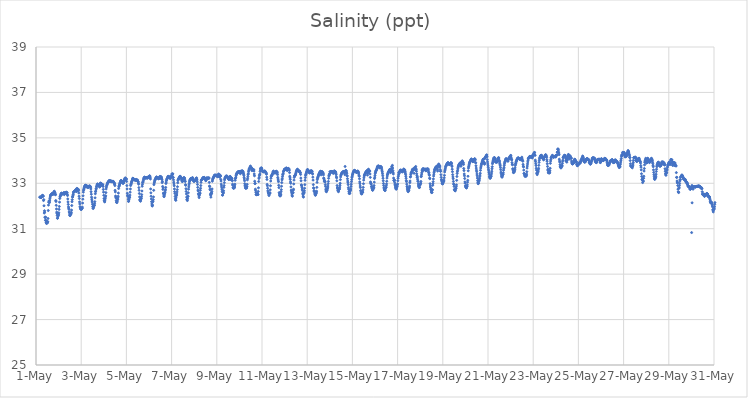
| Category | Salinity (ppt) |
|---|---|
| 44317.166666666664 | 32.39 |
| 44317.177083333336 | 32.39 |
| 44317.1875 | 32.39 |
| 44317.197916666664 | 32.39 |
| 44317.208333333336 | 32.39 |
| 44317.21875 | 32.39 |
| 44317.229166666664 | 32.37 |
| 44317.239583333336 | 32.39 |
| 44317.25 | 32.4 |
| 44317.260416666664 | 32.43 |
| 44317.270833333336 | 32.43 |
| 44317.28125 | 32.47 |
| 44317.291666666664 | 32.46 |
| 44317.302083333336 | 32.45 |
| 44317.3125 | 32.44 |
| 44317.322916666664 | 32.43 |
| 44317.333333333336 | 32.24 |
| 44317.34375 | 32.28 |
| 44317.354166666664 | 32.01 |
| 44317.364583333336 | 31.69 |
| 44317.375 | 31.79 |
| 44317.385416666664 | 31.73 |
| 44317.395833333336 | 31.51 |
| 44317.40625 | 31.49 |
| 44317.416666666664 | 31.37 |
| 44317.427083333336 | 31.51 |
| 44317.4375 | 31.37 |
| 44317.447916666664 | 31.28 |
| 44317.458333333336 | 31.25 |
| 44317.46875 | 31.23 |
| 44317.479166666664 | 31.3 |
| 44317.489583333336 | 31.32 |
| 44317.5 | 31.28 |
| 44317.510416666664 | 31.26 |
| 44317.520833333336 | 31.31 |
| 44317.53125 | 31.45 |
| 44317.541666666664 | 31.8 |
| 44317.552083333336 | 32.04 |
| 44317.5625 | 32.17 |
| 44317.572916666664 | 32.22 |
| 44317.583333333336 | 32.17 |
| 44317.59375 | 32.15 |
| 44317.604166666664 | 32.23 |
| 44317.614583333336 | 32.32 |
| 44317.625 | 32.39 |
| 44317.635416666664 | 32.44 |
| 44317.645833333336 | 32.48 |
| 44317.65625 | 32.48 |
| 44317.666666666664 | 32.49 |
| 44317.677083333336 | 32.51 |
| 44317.6875 | 32.52 |
| 44317.697916666664 | 32.53 |
| 44317.708333333336 | 32.55 |
| 44317.71875 | 32.53 |
| 44317.729166666664 | 32.53 |
| 44317.739583333336 | 32.52 |
| 44317.75 | 32.51 |
| 44317.760416666664 | 32.54 |
| 44317.770833333336 | 32.58 |
| 44317.78125 | 32.55 |
| 44317.791666666664 | 32.63 |
| 44317.802083333336 | 32.6 |
| 44317.8125 | 32.65 |
| 44317.822916666664 | 32.59 |
| 44317.833333333336 | 32.6 |
| 44317.84375 | 32.55 |
| 44317.854166666664 | 32.5 |
| 44317.864583333336 | 32.5 |
| 44317.875 | 32.24 |
| 44317.885416666664 | 32.2 |
| 44317.895833333336 | 32.03 |
| 44317.90625 | 31.87 |
| 44317.916666666664 | 31.73 |
| 44317.927083333336 | 31.67 |
| 44317.9375 | 31.59 |
| 44317.947916666664 | 31.46 |
| 44317.958333333336 | 31.47 |
| 44317.96875 | 31.54 |
| 44317.979166666664 | 31.58 |
| 44317.989583333336 | 31.59 |
| 44318.0 | 31.64 |
| 44318.010416666664 | 31.7 |
| 44318.020833333336 | 31.85 |
| 44318.03125 | 31.98 |
| 44318.041666666664 | 32.17 |
| 44318.052083333336 | 32.33 |
| 44318.0625 | 32.4 |
| 44318.072916666664 | 32.43 |
| 44318.083333333336 | 32.46 |
| 44318.09375 | 32.49 |
| 44318.104166666664 | 32.53 |
| 44318.114583333336 | 32.55 |
| 44318.125 | 32.56 |
| 44318.135416666664 | 32.56 |
| 44318.145833333336 | 32.55 |
| 44318.15625 | 32.54 |
| 44318.166666666664 | 32.53 |
| 44318.177083333336 | 32.53 |
| 44318.1875 | 32.54 |
| 44318.197916666664 | 32.55 |
| 44318.208333333336 | 32.57 |
| 44318.21875 | 32.57 |
| 44318.229166666664 | 32.58 |
| 44318.239583333336 | 32.55 |
| 44318.25 | 32.5 |
| 44318.260416666664 | 32.53 |
| 44318.270833333336 | 32.59 |
| 44318.28125 | 32.54 |
| 44318.291666666664 | 32.58 |
| 44318.302083333336 | 32.59 |
| 44318.3125 | 32.59 |
| 44318.322916666664 | 32.58 |
| 44318.333333333336 | 32.61 |
| 44318.34375 | 32.56 |
| 44318.354166666664 | 32.6 |
| 44318.364583333336 | 32.59 |
| 44318.375 | 32.58 |
| 44318.385416666664 | 32.51 |
| 44318.395833333336 | 32.46 |
| 44318.40625 | 32.31 |
| 44318.416666666664 | 32.18 |
| 44318.427083333336 | 32.07 |
| 44318.4375 | 31.96 |
| 44318.447916666664 | 31.9 |
| 44318.458333333336 | 31.85 |
| 44318.46875 | 31.74 |
| 44318.479166666664 | 31.7 |
| 44318.489583333336 | 31.61 |
| 44318.5 | 31.58 |
| 44318.510416666664 | 31.58 |
| 44318.520833333336 | 31.64 |
| 44318.53125 | 31.67 |
| 44318.541666666664 | 31.64 |
| 44318.552083333336 | 31.67 |
| 44318.5625 | 31.72 |
| 44318.572916666664 | 31.82 |
| 44318.583333333336 | 32.02 |
| 44318.59375 | 32.19 |
| 44318.604166666664 | 32.28 |
| 44318.614583333336 | 32.4 |
| 44318.625 | 32.4 |
| 44318.635416666664 | 32.47 |
| 44318.645833333336 | 32.51 |
| 44318.65625 | 32.58 |
| 44318.666666666664 | 32.62 |
| 44318.677083333336 | 32.63 |
| 44318.6875 | 32.64 |
| 44318.697916666664 | 32.65 |
| 44318.708333333336 | 32.64 |
| 44318.71875 | 32.65 |
| 44318.729166666664 | 32.66 |
| 44318.739583333336 | 32.68 |
| 44318.75 | 32.69 |
| 44318.760416666664 | 32.72 |
| 44318.770833333336 | 32.73 |
| 44318.78125 | 32.65 |
| 44318.791666666664 | 32.7 |
| 44318.802083333336 | 32.64 |
| 44318.8125 | 32.78 |
| 44318.822916666664 | 32.74 |
| 44318.833333333336 | 32.74 |
| 44318.84375 | 32.68 |
| 44318.854166666664 | 32.69 |
| 44318.864583333336 | 32.72 |
| 44318.875 | 32.73 |
| 44318.885416666664 | 32.68 |
| 44318.895833333336 | 32.57 |
| 44318.90625 | 32.43 |
| 44318.916666666664 | 32.33 |
| 44318.927083333336 | 32.18 |
| 44318.9375 | 32.09 |
| 44318.947916666664 | 31.97 |
| 44318.958333333336 | 31.92 |
| 44318.96875 | 31.89 |
| 44318.979166666664 | 31.87 |
| 44318.989583333336 | 31.86 |
| 44319.0 | 31.85 |
| 44319.010416666664 | 31.85 |
| 44319.020833333336 | 31.89 |
| 44319.03125 | 31.89 |
| 44319.041666666664 | 31.9 |
| 44319.052083333336 | 31.95 |
| 44319.0625 | 32.13 |
| 44319.072916666664 | 32.3 |
| 44319.083333333336 | 32.45 |
| 44319.09375 | 32.61 |
| 44319.104166666664 | 32.69 |
| 44319.114583333336 | 32.73 |
| 44319.125 | 32.77 |
| 44319.135416666664 | 32.82 |
| 44319.145833333336 | 32.85 |
| 44319.15625 | 32.87 |
| 44319.166666666664 | 32.89 |
| 44319.177083333336 | 32.91 |
| 44319.1875 | 32.91 |
| 44319.197916666664 | 32.9 |
| 44319.208333333336 | 32.91 |
| 44319.21875 | 32.84 |
| 44319.229166666664 | 32.9 |
| 44319.239583333336 | 32.85 |
| 44319.25 | 32.86 |
| 44319.260416666664 | 32.87 |
| 44319.270833333336 | 32.87 |
| 44319.28125 | 32.85 |
| 44319.291666666664 | 32.81 |
| 44319.302083333336 | 32.84 |
| 44319.3125 | 32.84 |
| 44319.322916666664 | 32.82 |
| 44319.333333333336 | 32.86 |
| 44319.34375 | 32.86 |
| 44319.354166666664 | 32.88 |
| 44319.364583333336 | 32.88 |
| 44319.375 | 32.86 |
| 44319.385416666664 | 32.88 |
| 44319.395833333336 | 32.86 |
| 44319.40625 | 32.85 |
| 44319.416666666664 | 32.81 |
| 44319.427083333336 | 32.75 |
| 44319.4375 | 32.63 |
| 44319.447916666664 | 32.52 |
| 44319.458333333336 | 32.39 |
| 44319.46875 | 32.3 |
| 44319.479166666664 | 32.22 |
| 44319.489583333336 | 32.17 |
| 44319.5 | 32.08 |
| 44319.510416666664 | 31.98 |
| 44319.520833333336 | 31.91 |
| 44319.53125 | 31.89 |
| 44319.541666666664 | 31.98 |
| 44319.552083333336 | 31.95 |
| 44319.5625 | 32.01 |
| 44319.572916666664 | 32.01 |
| 44319.583333333336 | 32.03 |
| 44319.59375 | 32.1 |
| 44319.604166666664 | 32.19 |
| 44319.614583333336 | 32.36 |
| 44319.625 | 32.54 |
| 44319.635416666664 | 32.63 |
| 44319.645833333336 | 32.66 |
| 44319.65625 | 32.75 |
| 44319.666666666664 | 32.76 |
| 44319.677083333336 | 32.84 |
| 44319.6875 | 32.87 |
| 44319.697916666664 | 32.91 |
| 44319.708333333336 | 32.94 |
| 44319.71875 | 32.97 |
| 44319.729166666664 | 32.96 |
| 44319.739583333336 | 32.94 |
| 44319.75 | 32.94 |
| 44319.760416666664 | 32.92 |
| 44319.770833333336 | 32.91 |
| 44319.78125 | 32.92 |
| 44319.791666666664 | 32.92 |
| 44319.802083333336 | 32.92 |
| 44319.8125 | 32.84 |
| 44319.822916666664 | 32.84 |
| 44319.833333333336 | 32.92 |
| 44319.84375 | 33.01 |
| 44319.854166666664 | 32.97 |
| 44319.864583333336 | 33 |
| 44319.875 | 33 |
| 44319.885416666664 | 32.99 |
| 44319.895833333336 | 32.95 |
| 44319.90625 | 32.93 |
| 44319.916666666664 | 32.91 |
| 44319.927083333336 | 32.9 |
| 44319.9375 | 32.95 |
| 44319.947916666664 | 32.94 |
| 44319.958333333336 | 32.93 |
| 44319.96875 | 32.86 |
| 44319.979166666664 | 32.73 |
| 44319.989583333336 | 32.61 |
| 44320.0 | 32.47 |
| 44320.010416666664 | 32.33 |
| 44320.020833333336 | 32.24 |
| 44320.03125 | 32.2 |
| 44320.041666666664 | 32.18 |
| 44320.052083333336 | 32.26 |
| 44320.0625 | 32.32 |
| 44320.072916666664 | 32.4 |
| 44320.083333333336 | 32.45 |
| 44320.09375 | 32.59 |
| 44320.104166666664 | 32.75 |
| 44320.114583333336 | 32.83 |
| 44320.125 | 32.89 |
| 44320.135416666664 | 32.92 |
| 44320.145833333336 | 32.96 |
| 44320.15625 | 32.97 |
| 44320.166666666664 | 33.01 |
| 44320.177083333336 | 33.03 |
| 44320.1875 | 33.05 |
| 44320.197916666664 | 33.06 |
| 44320.208333333336 | 33.07 |
| 44320.21875 | 33.08 |
| 44320.229166666664 | 33.11 |
| 44320.239583333336 | 33.12 |
| 44320.25 | 33.11 |
| 44320.260416666664 | 33.09 |
| 44320.270833333336 | 33.09 |
| 44320.28125 | 33.09 |
| 44320.291666666664 | 33.1 |
| 44320.302083333336 | 33.11 |
| 44320.3125 | 33.1 |
| 44320.322916666664 | 33.1 |
| 44320.333333333336 | 33.08 |
| 44320.34375 | 33.07 |
| 44320.354166666664 | 33.08 |
| 44320.364583333336 | 33.07 |
| 44320.375 | 33.07 |
| 44320.385416666664 | 33.08 |
| 44320.395833333336 | 33.08 |
| 44320.40625 | 33.09 |
| 44320.416666666664 | 33.08 |
| 44320.427083333336 | 33.07 |
| 44320.4375 | 33.05 |
| 44320.447916666664 | 33.03 |
| 44320.458333333336 | 33.03 |
| 44320.46875 | 32.98 |
| 44320.479166666664 | 32.96 |
| 44320.489583333336 | 32.9 |
| 44320.5 | 32.69 |
| 44320.510416666664 | 32.62 |
| 44320.520833333336 | 32.44 |
| 44320.53125 | 32.39 |
| 44320.541666666664 | 32.35 |
| 44320.552083333336 | 32.24 |
| 44320.5625 | 32.16 |
| 44320.572916666664 | 32.18 |
| 44320.583333333336 | 32.15 |
| 44320.59375 | 32.21 |
| 44320.604166666664 | 32.3 |
| 44320.614583333336 | 32.28 |
| 44320.625 | 32.36 |
| 44320.635416666664 | 32.43 |
| 44320.645833333336 | 32.57 |
| 44320.65625 | 32.77 |
| 44320.666666666664 | 32.85 |
| 44320.677083333336 | 32.88 |
| 44320.6875 | 32.9 |
| 44320.697916666664 | 32.95 |
| 44320.708333333336 | 32.98 |
| 44320.71875 | 33.02 |
| 44320.729166666664 | 33.03 |
| 44320.739583333336 | 33.08 |
| 44320.75 | 33.1 |
| 44320.760416666664 | 33.12 |
| 44320.770833333336 | 33.12 |
| 44320.78125 | 33.11 |
| 44320.791666666664 | 33.09 |
| 44320.802083333336 | 33.06 |
| 44320.8125 | 33.04 |
| 44320.822916666664 | 33.04 |
| 44320.833333333336 | 33.01 |
| 44320.84375 | 33.01 |
| 44320.854166666664 | 33.01 |
| 44320.864583333336 | 33 |
| 44320.875 | 33.03 |
| 44320.885416666664 | 33.1 |
| 44320.895833333336 | 33.07 |
| 44320.90625 | 33.15 |
| 44320.916666666664 | 33.19 |
| 44320.927083333336 | 33.17 |
| 44320.9375 | 33.16 |
| 44320.947916666664 | 33.24 |
| 44320.958333333336 | 33.2 |
| 44320.96875 | 33.17 |
| 44320.979166666664 | 33.16 |
| 44320.989583333336 | 33.18 |
| 44321.0 | 33.2 |
| 44321.010416666664 | 33.08 |
| 44321.020833333336 | 32.9 |
| 44321.03125 | 32.75 |
| 44321.041666666664 | 32.56 |
| 44321.052083333336 | 32.47 |
| 44321.0625 | 32.44 |
| 44321.072916666664 | 32.42 |
| 44321.083333333336 | 32.3 |
| 44321.09375 | 32.2 |
| 44321.104166666664 | 32.22 |
| 44321.114583333336 | 32.28 |
| 44321.125 | 32.36 |
| 44321.135416666664 | 32.37 |
| 44321.145833333336 | 32.39 |
| 44321.15625 | 32.48 |
| 44321.166666666664 | 32.61 |
| 44321.177083333336 | 32.75 |
| 44321.1875 | 32.9 |
| 44321.197916666664 | 32.95 |
| 44321.208333333336 | 32.97 |
| 44321.21875 | 33.01 |
| 44321.229166666664 | 33.06 |
| 44321.239583333336 | 33.08 |
| 44321.25 | 33.11 |
| 44321.260416666664 | 33.14 |
| 44321.270833333336 | 33.17 |
| 44321.28125 | 33.22 |
| 44321.291666666664 | 33.22 |
| 44321.302083333336 | 33.21 |
| 44321.3125 | 33.2 |
| 44321.322916666664 | 33.18 |
| 44321.333333333336 | 33.16 |
| 44321.34375 | 33.16 |
| 44321.354166666664 | 33.16 |
| 44321.364583333336 | 33.15 |
| 44321.375 | 33.16 |
| 44321.385416666664 | 33.15 |
| 44321.395833333336 | 33.13 |
| 44321.40625 | 33.15 |
| 44321.416666666664 | 33.14 |
| 44321.427083333336 | 33.14 |
| 44321.4375 | 33.17 |
| 44321.447916666664 | 33.15 |
| 44321.458333333336 | 33.14 |
| 44321.46875 | 33.13 |
| 44321.479166666664 | 33.12 |
| 44321.489583333336 | 33.15 |
| 44321.5 | 33.1 |
| 44321.510416666664 | 33.08 |
| 44321.520833333336 | 33.07 |
| 44321.53125 | 33.01 |
| 44321.541666666664 | 32.96 |
| 44321.552083333336 | 32.81 |
| 44321.5625 | 32.69 |
| 44321.572916666664 | 32.55 |
| 44321.583333333336 | 32.4 |
| 44321.59375 | 32.28 |
| 44321.604166666664 | 32.25 |
| 44321.614583333336 | 32.24 |
| 44321.625 | 32.21 |
| 44321.635416666664 | 32.28 |
| 44321.645833333336 | 32.33 |
| 44321.65625 | 32.34 |
| 44321.666666666664 | 32.41 |
| 44321.677083333336 | 32.5 |
| 44321.6875 | 32.66 |
| 44321.697916666664 | 32.87 |
| 44321.708333333336 | 32.95 |
| 44321.71875 | 33.03 |
| 44321.729166666664 | 33.05 |
| 44321.739583333336 | 33.07 |
| 44321.75 | 33.13 |
| 44321.760416666664 | 33.18 |
| 44321.770833333336 | 33.22 |
| 44321.78125 | 33.24 |
| 44321.791666666664 | 33.26 |
| 44321.802083333336 | 33.27 |
| 44321.8125 | 33.26 |
| 44321.822916666664 | 33.25 |
| 44321.833333333336 | 33.24 |
| 44321.84375 | 33.23 |
| 44321.854166666664 | 33.23 |
| 44321.864583333336 | 33.24 |
| 44321.875 | 33.25 |
| 44321.885416666664 | 33.25 |
| 44321.895833333336 | 33.25 |
| 44321.90625 | 33.23 |
| 44321.916666666664 | 33.24 |
| 44321.927083333336 | 33.23 |
| 44321.9375 | 33.24 |
| 44321.947916666664 | 33.27 |
| 44321.958333333336 | 33.26 |
| 44321.96875 | 33.25 |
| 44321.979166666664 | 33.26 |
| 44321.989583333336 | 33.25 |
| 44322.0 | 33.29 |
| 44322.010416666664 | 33.28 |
| 44322.020833333336 | 33.32 |
| 44322.03125 | 33.33 |
| 44322.041666666664 | 33.29 |
| 44322.052083333336 | 33.26 |
| 44322.0625 | 33.19 |
| 44322.072916666664 | 32.75 |
| 44322.083333333336 | 32.58 |
| 44322.09375 | 32.43 |
| 44322.104166666664 | 32.31 |
| 44322.114583333336 | 32.19 |
| 44322.125 | 32.09 |
| 44322.135416666664 | 32.01 |
| 44322.145833333336 | 32 |
| 44322.15625 | 32.04 |
| 44322.166666666664 | 32.18 |
| 44322.177083333336 | 32.21 |
| 44322.1875 | 32.28 |
| 44322.197916666664 | 32.4 |
| 44322.208333333336 | 32.69 |
| 44322.21875 | 32.94 |
| 44322.229166666664 | 33.01 |
| 44322.239583333336 | 33.05 |
| 44322.25 | 33.1 |
| 44322.260416666664 | 33.14 |
| 44322.270833333336 | 33.15 |
| 44322.28125 | 33.17 |
| 44322.291666666664 | 33.2 |
| 44322.302083333336 | 33.23 |
| 44322.3125 | 33.25 |
| 44322.322916666664 | 33.27 |
| 44322.333333333336 | 33.28 |
| 44322.34375 | 33.25 |
| 44322.354166666664 | 33.26 |
| 44322.364583333336 | 33.25 |
| 44322.375 | 33.25 |
| 44322.385416666664 | 33.25 |
| 44322.395833333336 | 33.23 |
| 44322.40625 | 33.22 |
| 44322.416666666664 | 33.2 |
| 44322.427083333336 | 33.23 |
| 44322.4375 | 33.2 |
| 44322.447916666664 | 33.24 |
| 44322.458333333336 | 33.23 |
| 44322.46875 | 33.24 |
| 44322.479166666664 | 33.3 |
| 44322.489583333336 | 33.25 |
| 44322.5 | 33.3 |
| 44322.510416666664 | 33.26 |
| 44322.520833333336 | 33.28 |
| 44322.53125 | 33.28 |
| 44322.541666666664 | 33.28 |
| 44322.552083333336 | 33.19 |
| 44322.5625 | 33.23 |
| 44322.572916666664 | 33.17 |
| 44322.583333333336 | 33.03 |
| 44322.59375 | 33.08 |
| 44322.604166666664 | 32.86 |
| 44322.614583333336 | 32.73 |
| 44322.625 | 32.8 |
| 44322.635416666664 | 32.57 |
| 44322.645833333336 | 32.53 |
| 44322.65625 | 32.44 |
| 44322.666666666664 | 32.41 |
| 44322.677083333336 | 32.45 |
| 44322.6875 | 32.52 |
| 44322.697916666664 | 32.57 |
| 44322.708333333336 | 32.59 |
| 44322.71875 | 32.67 |
| 44322.729166666664 | 32.73 |
| 44322.739583333336 | 32.82 |
| 44322.75 | 32.99 |
| 44322.760416666664 | 33.05 |
| 44322.770833333336 | 33.12 |
| 44322.78125 | 33.15 |
| 44322.791666666664 | 33.19 |
| 44322.802083333336 | 33.2 |
| 44322.8125 | 33.22 |
| 44322.822916666664 | 33.25 |
| 44322.833333333336 | 33.28 |
| 44322.84375 | 33.31 |
| 44322.854166666664 | 33.3 |
| 44322.864583333336 | 33.29 |
| 44322.875 | 33.29 |
| 44322.885416666664 | 33.28 |
| 44322.895833333336 | 33.27 |
| 44322.90625 | 33.28 |
| 44322.916666666664 | 33.25 |
| 44322.927083333336 | 33.23 |
| 44322.9375 | 33.21 |
| 44322.947916666664 | 33.24 |
| 44322.958333333336 | 33.26 |
| 44322.96875 | 33.29 |
| 44322.979166666664 | 33.29 |
| 44322.989583333336 | 33.31 |
| 44323.0 | 33.32 |
| 44323.010416666664 | 33.41 |
| 44323.020833333336 | 33.4 |
| 44323.03125 | 33.37 |
| 44323.041666666664 | 33.4 |
| 44323.052083333336 | 33.42 |
| 44323.0625 | 33.25 |
| 44323.072916666664 | 33.26 |
| 44323.083333333336 | 33.15 |
| 44323.09375 | 33.05 |
| 44323.104166666664 | 32.97 |
| 44323.114583333336 | 32.89 |
| 44323.125 | 32.75 |
| 44323.135416666664 | 32.63 |
| 44323.145833333336 | 32.55 |
| 44323.15625 | 32.42 |
| 44323.166666666664 | 32.32 |
| 44323.177083333336 | 32.27 |
| 44323.1875 | 32.25 |
| 44323.197916666664 | 32.36 |
| 44323.208333333336 | 32.45 |
| 44323.21875 | 32.47 |
| 44323.229166666664 | 32.53 |
| 44323.239583333336 | 32.62 |
| 44323.25 | 32.72 |
| 44323.260416666664 | 32.85 |
| 44323.270833333336 | 33.02 |
| 44323.28125 | 33.12 |
| 44323.291666666664 | 33.17 |
| 44323.302083333336 | 33.18 |
| 44323.3125 | 33.19 |
| 44323.322916666664 | 33.22 |
| 44323.333333333336 | 33.24 |
| 44323.34375 | 33.25 |
| 44323.354166666664 | 33.27 |
| 44323.364583333336 | 33.3 |
| 44323.375 | 33.31 |
| 44323.385416666664 | 33.3 |
| 44323.395833333336 | 33.29 |
| 44323.40625 | 33.26 |
| 44323.416666666664 | 33.23 |
| 44323.427083333336 | 33.23 |
| 44323.4375 | 33.2 |
| 44323.447916666664 | 33.13 |
| 44323.458333333336 | 33.16 |
| 44323.46875 | 33.08 |
| 44323.479166666664 | 33.08 |
| 44323.489583333336 | 33.09 |
| 44323.5 | 33.18 |
| 44323.510416666664 | 33.21 |
| 44323.520833333336 | 33.23 |
| 44323.53125 | 33.22 |
| 44323.541666666664 | 33.24 |
| 44323.552083333336 | 33.25 |
| 44323.5625 | 33.23 |
| 44323.572916666664 | 33.22 |
| 44323.583333333336 | 33.15 |
| 44323.59375 | 33.1 |
| 44323.604166666664 | 33.08 |
| 44323.614583333336 | 32.94 |
| 44323.625 | 32.91 |
| 44323.635416666664 | 32.76 |
| 44323.645833333336 | 32.64 |
| 44323.65625 | 32.53 |
| 44323.666666666664 | 32.39 |
| 44323.677083333336 | 32.29 |
| 44323.6875 | 32.27 |
| 44323.697916666664 | 32.24 |
| 44323.708333333336 | 32.34 |
| 44323.71875 | 32.43 |
| 44323.729166666664 | 32.43 |
| 44323.739583333336 | 32.58 |
| 44323.75 | 32.74 |
| 44323.760416666664 | 32.84 |
| 44323.770833333336 | 32.93 |
| 44323.78125 | 33 |
| 44323.791666666664 | 33.07 |
| 44323.802083333336 | 33.14 |
| 44323.8125 | 33.13 |
| 44323.822916666664 | 33.14 |
| 44323.833333333336 | 33.18 |
| 44323.84375 | 33.21 |
| 44323.854166666664 | 33.18 |
| 44323.864583333336 | 33.22 |
| 44323.875 | 33.19 |
| 44323.885416666664 | 33.2 |
| 44323.895833333336 | 33.21 |
| 44323.90625 | 33.21 |
| 44323.916666666664 | 33.23 |
| 44323.927083333336 | 33.25 |
| 44323.9375 | 33.19 |
| 44323.947916666664 | 33.19 |
| 44323.958333333336 | 33.18 |
| 44323.96875 | 33.12 |
| 44323.979166666664 | 33.09 |
| 44323.989583333336 | 33.09 |
| 44324.0 | 33.1 |
| 44324.010416666664 | 33.1 |
| 44324.020833333336 | 33.11 |
| 44324.03125 | 33.12 |
| 44324.041666666664 | 33.12 |
| 44324.052083333336 | 33.14 |
| 44324.0625 | 33.14 |
| 44324.072916666664 | 33.17 |
| 44324.083333333336 | 33.22 |
| 44324.09375 | 33.16 |
| 44324.104166666664 | 33.24 |
| 44324.114583333336 | 33.19 |
| 44324.125 | 33.15 |
| 44324.135416666664 | 33.06 |
| 44324.145833333336 | 32.95 |
| 44324.15625 | 32.82 |
| 44324.166666666664 | 32.7 |
| 44324.177083333336 | 32.66 |
| 44324.1875 | 32.54 |
| 44324.197916666664 | 32.51 |
| 44324.208333333336 | 32.44 |
| 44324.21875 | 32.37 |
| 44324.229166666664 | 32.47 |
| 44324.239583333336 | 32.53 |
| 44324.25 | 32.56 |
| 44324.260416666664 | 32.57 |
| 44324.270833333336 | 32.69 |
| 44324.28125 | 32.78 |
| 44324.291666666664 | 32.9 |
| 44324.302083333336 | 33.04 |
| 44324.3125 | 33.13 |
| 44324.322916666664 | 33.16 |
| 44324.333333333336 | 33.15 |
| 44324.34375 | 33.16 |
| 44324.354166666664 | 33.17 |
| 44324.364583333336 | 33.2 |
| 44324.375 | 33.22 |
| 44324.385416666664 | 33.25 |
| 44324.395833333336 | 33.24 |
| 44324.40625 | 33.24 |
| 44324.416666666664 | 33.24 |
| 44324.427083333336 | 33.24 |
| 44324.4375 | 33.24 |
| 44324.447916666664 | 33.26 |
| 44324.458333333336 | 33.23 |
| 44324.46875 | 33.22 |
| 44324.479166666664 | 33.22 |
| 44324.489583333336 | 33.2 |
| 44324.5 | 33.17 |
| 44324.510416666664 | 33.11 |
| 44324.520833333336 | 33.13 |
| 44324.53125 | 33.19 |
| 44324.541666666664 | 33.21 |
| 44324.552083333336 | 33.23 |
| 44324.5625 | 33.24 |
| 44324.572916666664 | 33.2 |
| 44324.583333333336 | 33.2 |
| 44324.59375 | 33.24 |
| 44324.604166666664 | 33.21 |
| 44324.614583333336 | 33.22 |
| 44324.625 | 33.24 |
| 44324.635416666664 | 33.21 |
| 44324.645833333336 | 33.22 |
| 44324.65625 | 33.24 |
| 44324.666666666664 | 33.04 |
| 44324.677083333336 | 32.88 |
| 44324.6875 | 32.85 |
| 44324.697916666664 | 32.74 |
| 44324.708333333336 | 32.71 |
| 44324.71875 | 32.49 |
| 44324.729166666664 | 32.55 |
| 44324.739583333336 | 32.39 |
| 44324.75 | 32.5 |
| 44324.760416666664 | 32.58 |
| 44324.770833333336 | 32.56 |
| 44324.78125 | 32.64 |
| 44324.791666666664 | 32.75 |
| 44324.802083333336 | 33.09 |
| 44324.8125 | 33.15 |
| 44324.822916666664 | 33.19 |
| 44324.833333333336 | 33.22 |
| 44324.84375 | 33.24 |
| 44324.854166666664 | 33.26 |
| 44324.864583333336 | 33.28 |
| 44324.875 | 33.31 |
| 44324.885416666664 | 33.32 |
| 44324.895833333336 | 33.35 |
| 44324.90625 | 33.35 |
| 44324.916666666664 | 33.35 |
| 44324.927083333336 | 33.37 |
| 44324.9375 | 33.35 |
| 44324.947916666664 | 33.34 |
| 44324.958333333336 | 33.33 |
| 44324.96875 | 33.34 |
| 44324.979166666664 | 33.36 |
| 44324.989583333336 | 33.33 |
| 44325.0 | 33.33 |
| 44325.010416666664 | 33.32 |
| 44325.020833333336 | 33.32 |
| 44325.03125 | 33.29 |
| 44325.041666666664 | 33.31 |
| 44325.052083333336 | 33.33 |
| 44325.0625 | 33.37 |
| 44325.072916666664 | 33.39 |
| 44325.083333333336 | 33.41 |
| 44325.09375 | 33.37 |
| 44325.104166666664 | 33.31 |
| 44325.114583333336 | 33.29 |
| 44325.125 | 33.27 |
| 44325.135416666664 | 33.35 |
| 44325.145833333336 | 33.36 |
| 44325.15625 | 33.31 |
| 44325.166666666664 | 33.32 |
| 44325.177083333336 | 33.17 |
| 44325.1875 | 33.1 |
| 44325.197916666664 | 32.96 |
| 44325.208333333336 | 32.88 |
| 44325.21875 | 32.8 |
| 44325.229166666664 | 32.72 |
| 44325.239583333336 | 32.63 |
| 44325.25 | 32.48 |
| 44325.260416666664 | 32.48 |
| 44325.270833333336 | 32.59 |
| 44325.28125 | 32.58 |
| 44325.291666666664 | 32.57 |
| 44325.302083333336 | 32.67 |
| 44325.3125 | 32.82 |
| 44325.322916666664 | 32.9 |
| 44325.333333333336 | 33.03 |
| 44325.34375 | 33.15 |
| 44325.354166666664 | 33.2 |
| 44325.364583333336 | 33.25 |
| 44325.375 | 33.23 |
| 44325.385416666664 | 33.27 |
| 44325.395833333336 | 33.28 |
| 44325.40625 | 33.32 |
| 44325.416666666664 | 33.3 |
| 44325.427083333336 | 33.31 |
| 44325.4375 | 33.31 |
| 44325.447916666664 | 33.32 |
| 44325.458333333336 | 33.3 |
| 44325.46875 | 33.29 |
| 44325.479166666664 | 33.27 |
| 44325.489583333336 | 33.26 |
| 44325.5 | 33.23 |
| 44325.510416666664 | 33.19 |
| 44325.520833333336 | 33.21 |
| 44325.53125 | 33.17 |
| 44325.541666666664 | 33.17 |
| 44325.552083333336 | 33.21 |
| 44325.5625 | 33.2 |
| 44325.572916666664 | 33.24 |
| 44325.583333333336 | 33.3 |
| 44325.59375 | 33.3 |
| 44325.604166666664 | 33.2 |
| 44325.614583333336 | 33.18 |
| 44325.625 | 33.19 |
| 44325.635416666664 | 33.16 |
| 44325.645833333336 | 33.24 |
| 44325.65625 | 33.22 |
| 44325.666666666664 | 33.21 |
| 44325.677083333336 | 33.14 |
| 44325.6875 | 33.11 |
| 44325.697916666664 | 32.96 |
| 44325.708333333336 | 32.91 |
| 44325.71875 | 32.81 |
| 44325.729166666664 | 32.79 |
| 44325.739583333336 | 32.79 |
| 44325.75 | 32.79 |
| 44325.760416666664 | 32.79 |
| 44325.770833333336 | 32.83 |
| 44325.78125 | 32.81 |
| 44325.791666666664 | 32.88 |
| 44325.802083333336 | 32.96 |
| 44325.8125 | 33.13 |
| 44325.822916666664 | 33.21 |
| 44325.833333333336 | 33.23 |
| 44325.84375 | 33.27 |
| 44325.854166666664 | 33.34 |
| 44325.864583333336 | 33.38 |
| 44325.875 | 33.41 |
| 44325.885416666664 | 33.44 |
| 44325.895833333336 | 33.46 |
| 44325.90625 | 33.44 |
| 44325.916666666664 | 33.45 |
| 44325.927083333336 | 33.49 |
| 44325.9375 | 33.5 |
| 44325.947916666664 | 33.51 |
| 44325.958333333336 | 33.51 |
| 44325.96875 | 33.51 |
| 44325.979166666664 | 33.5 |
| 44325.989583333336 | 33.49 |
| 44326.0 | 33.5 |
| 44326.010416666664 | 33.5 |
| 44326.020833333336 | 33.51 |
| 44326.03125 | 33.53 |
| 44326.041666666664 | 33.42 |
| 44326.052083333336 | 33.48 |
| 44326.0625 | 33.46 |
| 44326.072916666664 | 33.48 |
| 44326.083333333336 | 33.54 |
| 44326.09375 | 33.51 |
| 44326.104166666664 | 33.53 |
| 44326.114583333336 | 33.54 |
| 44326.125 | 33.52 |
| 44326.135416666664 | 33.55 |
| 44326.145833333336 | 33.52 |
| 44326.15625 | 33.52 |
| 44326.166666666664 | 33.48 |
| 44326.177083333336 | 33.44 |
| 44326.1875 | 33.39 |
| 44326.197916666664 | 33.34 |
| 44326.208333333336 | 33.25 |
| 44326.21875 | 33.19 |
| 44326.229166666664 | 33.11 |
| 44326.239583333336 | 32.98 |
| 44326.25 | 32.91 |
| 44326.260416666664 | 32.85 |
| 44326.270833333336 | 32.8 |
| 44326.28125 | 32.78 |
| 44326.291666666664 | 32.79 |
| 44326.302083333336 | 32.84 |
| 44326.3125 | 32.84 |
| 44326.322916666664 | 32.79 |
| 44326.333333333336 | 32.85 |
| 44326.34375 | 32.95 |
| 44326.354166666664 | 33.15 |
| 44326.364583333336 | 33.22 |
| 44326.375 | 33.3 |
| 44326.385416666664 | 33.39 |
| 44326.395833333336 | 33.42 |
| 44326.40625 | 33.51 |
| 44326.416666666664 | 33.57 |
| 44326.427083333336 | 33.63 |
| 44326.4375 | 33.61 |
| 44326.447916666664 | 33.65 |
| 44326.458333333336 | 33.67 |
| 44326.46875 | 33.68 |
| 44326.479166666664 | 33.73 |
| 44326.489583333336 | 33.76 |
| 44326.5 | 33.71 |
| 44326.510416666664 | 33.68 |
| 44326.520833333336 | 33.67 |
| 44326.53125 | 33.69 |
| 44326.541666666664 | 33.68 |
| 44326.552083333336 | 33.56 |
| 44326.5625 | 33.59 |
| 44326.572916666664 | 33.59 |
| 44326.583333333336 | 33.62 |
| 44326.59375 | 33.59 |
| 44326.604166666664 | 33.58 |
| 44326.614583333336 | 33.58 |
| 44326.625 | 33.6 |
| 44326.635416666664 | 33.6 |
| 44326.645833333336 | 33.54 |
| 44326.65625 | 33.41 |
| 44326.666666666664 | 33.33 |
| 44326.677083333336 | 33.09 |
| 44326.6875 | 32.99 |
| 44326.697916666664 | 32.99 |
| 44326.708333333336 | 32.74 |
| 44326.71875 | 32.68 |
| 44326.729166666664 | 32.6 |
| 44326.739583333336 | 32.5 |
| 44326.75 | 32.51 |
| 44326.760416666664 | 32.5 |
| 44326.770833333336 | 32.5 |
| 44326.78125 | 32.52 |
| 44326.791666666664 | 32.53 |
| 44326.802083333336 | 32.56 |
| 44326.8125 | 32.51 |
| 44326.822916666664 | 32.5 |
| 44326.833333333336 | 32.64 |
| 44326.84375 | 32.8 |
| 44326.854166666664 | 33.08 |
| 44326.864583333336 | 33.21 |
| 44326.875 | 33.26 |
| 44326.885416666664 | 33.34 |
| 44326.895833333336 | 33.38 |
| 44326.90625 | 33.41 |
| 44326.916666666664 | 33.52 |
| 44326.927083333336 | 33.58 |
| 44326.9375 | 33.65 |
| 44326.947916666664 | 33.64 |
| 44326.958333333336 | 33.68 |
| 44326.96875 | 33.66 |
| 44326.979166666664 | 33.67 |
| 44326.989583333336 | 33.63 |
| 44327.0 | 33.62 |
| 44327.010416666664 | 33.56 |
| 44327.020833333336 | 33.52 |
| 44327.03125 | 33.52 |
| 44327.041666666664 | 33.51 |
| 44327.052083333336 | 33.51 |
| 44327.0625 | 33.51 |
| 44327.072916666664 | 33.51 |
| 44327.083333333336 | 33.51 |
| 44327.09375 | 33.51 |
| 44327.104166666664 | 33.51 |
| 44327.114583333336 | 33.54 |
| 44327.125 | 33.54 |
| 44327.135416666664 | 33.52 |
| 44327.145833333336 | 33.52 |
| 44327.15625 | 33.49 |
| 44327.166666666664 | 33.47 |
| 44327.177083333336 | 33.47 |
| 44327.1875 | 33.43 |
| 44327.197916666664 | 33.4 |
| 44327.208333333336 | 33.27 |
| 44327.21875 | 33.17 |
| 44327.229166666664 | 32.95 |
| 44327.239583333336 | 32.89 |
| 44327.25 | 32.78 |
| 44327.260416666664 | 32.67 |
| 44327.270833333336 | 32.62 |
| 44327.28125 | 32.58 |
| 44327.291666666664 | 32.55 |
| 44327.302083333336 | 32.49 |
| 44327.3125 | 32.46 |
| 44327.322916666664 | 32.56 |
| 44327.333333333336 | 32.55 |
| 44327.34375 | 32.55 |
| 44327.354166666664 | 32.58 |
| 44327.364583333336 | 32.71 |
| 44327.375 | 32.89 |
| 44327.385416666664 | 33.1 |
| 44327.395833333336 | 33.22 |
| 44327.40625 | 33.3 |
| 44327.416666666664 | 33.34 |
| 44327.427083333336 | 33.34 |
| 44327.4375 | 33.35 |
| 44327.447916666664 | 33.38 |
| 44327.458333333336 | 33.41 |
| 44327.46875 | 33.42 |
| 44327.479166666664 | 33.46 |
| 44327.489583333336 | 33.51 |
| 44327.5 | 33.5 |
| 44327.510416666664 | 33.54 |
| 44327.520833333336 | 33.5 |
| 44327.53125 | 33.47 |
| 44327.541666666664 | 33.46 |
| 44327.552083333336 | 33.48 |
| 44327.5625 | 33.47 |
| 44327.572916666664 | 33.46 |
| 44327.583333333336 | 33.45 |
| 44327.59375 | 33.49 |
| 44327.604166666664 | 33.5 |
| 44327.614583333336 | 33.52 |
| 44327.625 | 33.51 |
| 44327.635416666664 | 33.53 |
| 44327.645833333336 | 33.52 |
| 44327.65625 | 33.49 |
| 44327.666666666664 | 33.44 |
| 44327.677083333336 | 33.49 |
| 44327.6875 | 33.38 |
| 44327.697916666664 | 33.26 |
| 44327.708333333336 | 33.19 |
| 44327.71875 | 33.14 |
| 44327.729166666664 | 33.07 |
| 44327.739583333336 | 32.91 |
| 44327.75 | 32.81 |
| 44327.760416666664 | 32.59 |
| 44327.770833333336 | 32.53 |
| 44327.78125 | 32.47 |
| 44327.791666666664 | 32.45 |
| 44327.802083333336 | 32.44 |
| 44327.8125 | 32.5 |
| 44327.822916666664 | 32.46 |
| 44327.833333333336 | 32.52 |
| 44327.84375 | 32.63 |
| 44327.854166666664 | 32.72 |
| 44327.864583333336 | 32.87 |
| 44327.875 | 33.03 |
| 44327.885416666664 | 33.15 |
| 44327.895833333336 | 33.2 |
| 44327.90625 | 33.29 |
| 44327.916666666664 | 33.37 |
| 44327.927083333336 | 33.4 |
| 44327.9375 | 33.43 |
| 44327.947916666664 | 33.51 |
| 44327.958333333336 | 33.53 |
| 44327.96875 | 33.56 |
| 44327.979166666664 | 33.58 |
| 44327.989583333336 | 33.62 |
| 44328.0 | 33.6 |
| 44328.010416666664 | 33.62 |
| 44328.020833333336 | 33.63 |
| 44328.03125 | 33.61 |
| 44328.041666666664 | 33.61 |
| 44328.052083333336 | 33.64 |
| 44328.0625 | 33.65 |
| 44328.072916666664 | 33.68 |
| 44328.083333333336 | 33.62 |
| 44328.09375 | 33.62 |
| 44328.104166666664 | 33.6 |
| 44328.114583333336 | 33.56 |
| 44328.125 | 33.61 |
| 44328.135416666664 | 33.63 |
| 44328.145833333336 | 33.61 |
| 44328.15625 | 33.66 |
| 44328.166666666664 | 33.64 |
| 44328.177083333336 | 33.62 |
| 44328.1875 | 33.64 |
| 44328.197916666664 | 33.61 |
| 44328.208333333336 | 33.57 |
| 44328.21875 | 33.47 |
| 44328.229166666664 | 33.31 |
| 44328.239583333336 | 33.24 |
| 44328.25 | 33.17 |
| 44328.260416666664 | 33.06 |
| 44328.270833333336 | 33 |
| 44328.28125 | 32.84 |
| 44328.291666666664 | 32.7 |
| 44328.302083333336 | 32.66 |
| 44328.3125 | 32.59 |
| 44328.322916666664 | 32.53 |
| 44328.333333333336 | 32.46 |
| 44328.34375 | 32.43 |
| 44328.354166666664 | 32.56 |
| 44328.364583333336 | 32.58 |
| 44328.375 | 32.59 |
| 44328.385416666664 | 32.7 |
| 44328.395833333336 | 32.74 |
| 44328.40625 | 32.97 |
| 44328.416666666664 | 33.14 |
| 44328.427083333336 | 33.26 |
| 44328.4375 | 33.32 |
| 44328.447916666664 | 33.33 |
| 44328.458333333336 | 33.34 |
| 44328.46875 | 33.34 |
| 44328.479166666664 | 33.38 |
| 44328.489583333336 | 33.41 |
| 44328.5 | 33.45 |
| 44328.510416666664 | 33.49 |
| 44328.520833333336 | 33.52 |
| 44328.53125 | 33.55 |
| 44328.541666666664 | 33.58 |
| 44328.552083333336 | 33.59 |
| 44328.5625 | 33.6 |
| 44328.572916666664 | 33.62 |
| 44328.583333333336 | 33.59 |
| 44328.59375 | 33.55 |
| 44328.604166666664 | 33.55 |
| 44328.614583333336 | 33.54 |
| 44328.625 | 33.56 |
| 44328.635416666664 | 33.53 |
| 44328.645833333336 | 33.53 |
| 44328.65625 | 33.52 |
| 44328.666666666664 | 33.53 |
| 44328.677083333336 | 33.49 |
| 44328.6875 | 33.48 |
| 44328.697916666664 | 33.46 |
| 44328.708333333336 | 33.39 |
| 44328.71875 | 33.23 |
| 44328.729166666664 | 33.11 |
| 44328.739583333336 | 32.93 |
| 44328.75 | 32.91 |
| 44328.760416666664 | 32.88 |
| 44328.770833333336 | 32.81 |
| 44328.78125 | 32.74 |
| 44328.791666666664 | 32.68 |
| 44328.802083333336 | 32.56 |
| 44328.8125 | 32.5 |
| 44328.822916666664 | 32.43 |
| 44328.833333333336 | 32.39 |
| 44328.84375 | 32.55 |
| 44328.854166666664 | 32.57 |
| 44328.864583333336 | 32.6 |
| 44328.875 | 32.67 |
| 44328.885416666664 | 32.78 |
| 44328.895833333336 | 32.94 |
| 44328.90625 | 33.13 |
| 44328.916666666664 | 33.25 |
| 44328.927083333336 | 33.34 |
| 44328.9375 | 33.39 |
| 44328.947916666664 | 33.41 |
| 44328.958333333336 | 33.45 |
| 44328.96875 | 33.48 |
| 44328.979166666664 | 33.53 |
| 44328.989583333336 | 33.54 |
| 44329.0 | 33.59 |
| 44329.010416666664 | 33.6 |
| 44329.020833333336 | 33.6 |
| 44329.03125 | 33.59 |
| 44329.041666666664 | 33.56 |
| 44329.052083333336 | 33.55 |
| 44329.0625 | 33.53 |
| 44329.072916666664 | 33.52 |
| 44329.083333333336 | 33.49 |
| 44329.09375 | 33.47 |
| 44329.104166666664 | 33.46 |
| 44329.114583333336 | 33.46 |
| 44329.125 | 33.47 |
| 44329.135416666664 | 33.49 |
| 44329.145833333336 | 33.49 |
| 44329.15625 | 33.51 |
| 44329.166666666664 | 33.56 |
| 44329.177083333336 | 33.53 |
| 44329.1875 | 33.49 |
| 44329.197916666664 | 33.54 |
| 44329.208333333336 | 33.52 |
| 44329.21875 | 33.53 |
| 44329.229166666664 | 33.44 |
| 44329.239583333336 | 33.41 |
| 44329.25 | 33.27 |
| 44329.260416666664 | 33.14 |
| 44329.270833333336 | 32.94 |
| 44329.28125 | 32.8 |
| 44329.291666666664 | 32.78 |
| 44329.302083333336 | 32.67 |
| 44329.3125 | 32.64 |
| 44329.322916666664 | 32.65 |
| 44329.333333333336 | 32.57 |
| 44329.34375 | 32.52 |
| 44329.354166666664 | 32.49 |
| 44329.364583333336 | 32.47 |
| 44329.375 | 32.57 |
| 44329.385416666664 | 32.55 |
| 44329.395833333336 | 32.54 |
| 44329.40625 | 32.6 |
| 44329.416666666664 | 32.65 |
| 44329.427083333336 | 32.82 |
| 44329.4375 | 33.04 |
| 44329.447916666664 | 33.16 |
| 44329.458333333336 | 33.22 |
| 44329.46875 | 33.26 |
| 44329.479166666664 | 33.29 |
| 44329.489583333336 | 33.32 |
| 44329.5 | 33.35 |
| 44329.510416666664 | 33.38 |
| 44329.520833333336 | 33.41 |
| 44329.53125 | 33.43 |
| 44329.541666666664 | 33.45 |
| 44329.552083333336 | 33.47 |
| 44329.5625 | 33.49 |
| 44329.572916666664 | 33.51 |
| 44329.583333333336 | 33.52 |
| 44329.59375 | 33.53 |
| 44329.604166666664 | 33.44 |
| 44329.614583333336 | 33.37 |
| 44329.625 | 33.45 |
| 44329.635416666664 | 33.51 |
| 44329.645833333336 | 33.45 |
| 44329.65625 | 33.52 |
| 44329.666666666664 | 33.45 |
| 44329.677083333336 | 33.49 |
| 44329.6875 | 33.46 |
| 44329.697916666664 | 33.45 |
| 44329.708333333336 | 33.44 |
| 44329.71875 | 33.37 |
| 44329.729166666664 | 33.23 |
| 44329.739583333336 | 33.22 |
| 44329.75 | 33.15 |
| 44329.760416666664 | 33.08 |
| 44329.770833333336 | 33.11 |
| 44329.78125 | 33.07 |
| 44329.791666666664 | 33.06 |
| 44329.802083333336 | 32.94 |
| 44329.8125 | 32.86 |
| 44329.822916666664 | 32.74 |
| 44329.833333333336 | 32.67 |
| 44329.84375 | 32.64 |
| 44329.854166666664 | 32.63 |
| 44329.864583333336 | 32.7 |
| 44329.875 | 32.76 |
| 44329.885416666664 | 32.7 |
| 44329.895833333336 | 32.76 |
| 44329.90625 | 32.82 |
| 44329.916666666664 | 32.88 |
| 44329.927083333336 | 32.98 |
| 44329.9375 | 33.08 |
| 44329.947916666664 | 33.22 |
| 44329.958333333336 | 33.32 |
| 44329.96875 | 33.35 |
| 44329.979166666664 | 33.38 |
| 44329.989583333336 | 33.41 |
| 44330.0 | 33.44 |
| 44330.010416666664 | 33.51 |
| 44330.020833333336 | 33.51 |
| 44330.03125 | 33.51 |
| 44330.041666666664 | 33.51 |
| 44330.052083333336 | 33.52 |
| 44330.0625 | 33.5 |
| 44330.072916666664 | 33.49 |
| 44330.083333333336 | 33.52 |
| 44330.09375 | 33.51 |
| 44330.104166666664 | 33.51 |
| 44330.114583333336 | 33.5 |
| 44330.125 | 33.49 |
| 44330.135416666664 | 33.47 |
| 44330.145833333336 | 33.45 |
| 44330.15625 | 33.44 |
| 44330.166666666664 | 33.47 |
| 44330.177083333336 | 33.48 |
| 44330.1875 | 33.48 |
| 44330.197916666664 | 33.55 |
| 44330.208333333336 | 33.48 |
| 44330.21875 | 33.51 |
| 44330.229166666664 | 33.52 |
| 44330.239583333336 | 33.52 |
| 44330.25 | 33.51 |
| 44330.260416666664 | 33.47 |
| 44330.270833333336 | 33.42 |
| 44330.28125 | 33.38 |
| 44330.291666666664 | 33.28 |
| 44330.302083333336 | 33.24 |
| 44330.3125 | 33.11 |
| 44330.322916666664 | 32.9 |
| 44330.333333333336 | 32.79 |
| 44330.34375 | 32.81 |
| 44330.354166666664 | 32.7 |
| 44330.364583333336 | 32.7 |
| 44330.375 | 32.65 |
| 44330.385416666664 | 32.63 |
| 44330.395833333336 | 32.72 |
| 44330.40625 | 32.73 |
| 44330.416666666664 | 32.74 |
| 44330.427083333336 | 32.76 |
| 44330.4375 | 32.83 |
| 44330.447916666664 | 32.91 |
| 44330.458333333336 | 33 |
| 44330.46875 | 33.16 |
| 44330.479166666664 | 33.28 |
| 44330.489583333336 | 33.35 |
| 44330.5 | 33.38 |
| 44330.510416666664 | 33.41 |
| 44330.520833333336 | 33.43 |
| 44330.53125 | 33.45 |
| 44330.541666666664 | 33.45 |
| 44330.552083333336 | 33.47 |
| 44330.5625 | 33.48 |
| 44330.572916666664 | 33.49 |
| 44330.583333333336 | 33.5 |
| 44330.59375 | 33.51 |
| 44330.604166666664 | 33.52 |
| 44330.614583333336 | 33.51 |
| 44330.625 | 33.52 |
| 44330.635416666664 | 33.49 |
| 44330.645833333336 | 33.47 |
| 44330.65625 | 33.52 |
| 44330.666666666664 | 33.38 |
| 44330.677083333336 | 33.74 |
| 44330.6875 | 33.49 |
| 44330.697916666664 | 33.53 |
| 44330.708333333336 | 33.57 |
| 44330.71875 | 33.51 |
| 44330.729166666664 | 33.55 |
| 44330.739583333336 | 33.48 |
| 44330.75 | 33.43 |
| 44330.760416666664 | 33.33 |
| 44330.770833333336 | 33.32 |
| 44330.78125 | 33.2 |
| 44330.791666666664 | 33.1 |
| 44330.802083333336 | 33.03 |
| 44330.8125 | 32.94 |
| 44330.822916666664 | 32.81 |
| 44330.833333333336 | 32.74 |
| 44330.84375 | 32.64 |
| 44330.854166666664 | 32.57 |
| 44330.864583333336 | 32.55 |
| 44330.875 | 32.55 |
| 44330.885416666664 | 32.56 |
| 44330.895833333336 | 32.63 |
| 44330.90625 | 32.68 |
| 44330.916666666664 | 32.7 |
| 44330.927083333336 | 32.75 |
| 44330.9375 | 32.86 |
| 44330.947916666664 | 32.96 |
| 44330.958333333336 | 33.07 |
| 44330.96875 | 33.16 |
| 44330.979166666664 | 33.25 |
| 44330.989583333336 | 33.3 |
| 44331.0 | 33.36 |
| 44331.010416666664 | 33.4 |
| 44331.020833333336 | 33.42 |
| 44331.03125 | 33.47 |
| 44331.041666666664 | 33.5 |
| 44331.052083333336 | 33.52 |
| 44331.0625 | 33.52 |
| 44331.072916666664 | 33.55 |
| 44331.083333333336 | 33.56 |
| 44331.09375 | 33.57 |
| 44331.104166666664 | 33.56 |
| 44331.114583333336 | 33.54 |
| 44331.125 | 33.53 |
| 44331.135416666664 | 33.52 |
| 44331.145833333336 | 33.53 |
| 44331.15625 | 33.52 |
| 44331.166666666664 | 33.48 |
| 44331.177083333336 | 33.49 |
| 44331.1875 | 33.48 |
| 44331.197916666664 | 33.49 |
| 44331.208333333336 | 33.53 |
| 44331.21875 | 33.5 |
| 44331.229166666664 | 33.54 |
| 44331.239583333336 | 33.51 |
| 44331.25 | 33.53 |
| 44331.260416666664 | 33.49 |
| 44331.270833333336 | 33.47 |
| 44331.28125 | 33.41 |
| 44331.291666666664 | 33.34 |
| 44331.302083333336 | 33.31 |
| 44331.3125 | 33.2 |
| 44331.322916666664 | 33.06 |
| 44331.333333333336 | 32.98 |
| 44331.34375 | 32.88 |
| 44331.354166666664 | 32.81 |
| 44331.364583333336 | 32.68 |
| 44331.375 | 32.66 |
| 44331.385416666664 | 32.58 |
| 44331.395833333336 | 32.55 |
| 44331.40625 | 32.54 |
| 44331.416666666664 | 32.53 |
| 44331.427083333336 | 32.61 |
| 44331.4375 | 32.61 |
| 44331.447916666664 | 32.6 |
| 44331.458333333336 | 32.61 |
| 44331.46875 | 32.71 |
| 44331.479166666664 | 32.82 |
| 44331.489583333336 | 32.98 |
| 44331.5 | 33.14 |
| 44331.510416666664 | 33.24 |
| 44331.520833333336 | 33.32 |
| 44331.53125 | 33.36 |
| 44331.541666666664 | 33.37 |
| 44331.552083333336 | 33.4 |
| 44331.5625 | 33.42 |
| 44331.572916666664 | 33.44 |
| 44331.583333333336 | 33.46 |
| 44331.59375 | 33.49 |
| 44331.604166666664 | 33.5 |
| 44331.614583333336 | 33.51 |
| 44331.625 | 33.51 |
| 44331.635416666664 | 33.54 |
| 44331.645833333336 | 33.56 |
| 44331.65625 | 33.55 |
| 44331.666666666664 | 33.36 |
| 44331.677083333336 | 33.46 |
| 44331.6875 | 33.45 |
| 44331.697916666664 | 33.51 |
| 44331.708333333336 | 33.62 |
| 44331.71875 | 33.6 |
| 44331.729166666664 | 33.58 |
| 44331.739583333336 | 33.54 |
| 44331.75 | 33.53 |
| 44331.760416666664 | 33.53 |
| 44331.770833333336 | 33.54 |
| 44331.78125 | 33.41 |
| 44331.791666666664 | 33.26 |
| 44331.802083333336 | 33.06 |
| 44331.8125 | 33.01 |
| 44331.822916666664 | 32.98 |
| 44331.833333333336 | 32.96 |
| 44331.84375 | 32.85 |
| 44331.854166666664 | 32.87 |
| 44331.864583333336 | 32.79 |
| 44331.875 | 32.76 |
| 44331.885416666664 | 32.71 |
| 44331.895833333336 | 32.69 |
| 44331.90625 | 32.72 |
| 44331.916666666664 | 32.77 |
| 44331.927083333336 | 32.79 |
| 44331.9375 | 32.77 |
| 44331.947916666664 | 32.82 |
| 44331.958333333336 | 32.9 |
| 44331.96875 | 33.05 |
| 44331.979166666664 | 33.21 |
| 44331.989583333336 | 33.27 |
| 44332.0 | 33.35 |
| 44332.010416666664 | 33.44 |
| 44332.020833333336 | 33.48 |
| 44332.03125 | 33.52 |
| 44332.041666666664 | 33.55 |
| 44332.052083333336 | 33.57 |
| 44332.0625 | 33.59 |
| 44332.072916666664 | 33.61 |
| 44332.083333333336 | 33.64 |
| 44332.09375 | 33.68 |
| 44332.104166666664 | 33.72 |
| 44332.114583333336 | 33.74 |
| 44332.125 | 33.75 |
| 44332.135416666664 | 33.76 |
| 44332.145833333336 | 33.75 |
| 44332.15625 | 33.75 |
| 44332.166666666664 | 33.76 |
| 44332.177083333336 | 33.74 |
| 44332.1875 | 33.7 |
| 44332.197916666664 | 33.68 |
| 44332.208333333336 | 33.7 |
| 44332.21875 | 33.71 |
| 44332.229166666664 | 33.71 |
| 44332.239583333336 | 33.72 |
| 44332.25 | 33.74 |
| 44332.260416666664 | 33.73 |
| 44332.270833333336 | 33.7 |
| 44332.28125 | 33.71 |
| 44332.291666666664 | 33.66 |
| 44332.302083333336 | 33.59 |
| 44332.3125 | 33.54 |
| 44332.322916666664 | 33.5 |
| 44332.333333333336 | 33.42 |
| 44332.34375 | 33.33 |
| 44332.354166666664 | 33.22 |
| 44332.364583333336 | 33.11 |
| 44332.375 | 32.99 |
| 44332.385416666664 | 32.9 |
| 44332.395833333336 | 32.81 |
| 44332.40625 | 32.76 |
| 44332.416666666664 | 32.72 |
| 44332.427083333336 | 32.71 |
| 44332.4375 | 32.69 |
| 44332.447916666664 | 32.68 |
| 44332.458333333336 | 32.75 |
| 44332.46875 | 32.79 |
| 44332.479166666664 | 32.81 |
| 44332.489583333336 | 32.82 |
| 44332.5 | 32.89 |
| 44332.510416666664 | 32.97 |
| 44332.520833333336 | 33.09 |
| 44332.53125 | 33.23 |
| 44332.541666666664 | 33.32 |
| 44332.552083333336 | 33.39 |
| 44332.5625 | 33.4 |
| 44332.572916666664 | 33.44 |
| 44332.583333333336 | 33.47 |
| 44332.59375 | 33.49 |
| 44332.604166666664 | 33.51 |
| 44332.614583333336 | 33.54 |
| 44332.625 | 33.53 |
| 44332.635416666664 | 33.55 |
| 44332.645833333336 | 33.6 |
| 44332.65625 | 33.61 |
| 44332.666666666664 | 33.61 |
| 44332.677083333336 | 33.62 |
| 44332.6875 | 33.47 |
| 44332.697916666664 | 33.49 |
| 44332.708333333336 | 33.61 |
| 44332.71875 | 33.62 |
| 44332.729166666664 | 33.61 |
| 44332.739583333336 | 33.74 |
| 44332.75 | 33.71 |
| 44332.760416666664 | 33.53 |
| 44332.770833333336 | 33.79 |
| 44332.78125 | 33.67 |
| 44332.791666666664 | 33.56 |
| 44332.802083333336 | 33.48 |
| 44332.8125 | 33.41 |
| 44332.822916666664 | 33.23 |
| 44332.833333333336 | 33.13 |
| 44332.84375 | 33.13 |
| 44332.854166666664 | 33.1 |
| 44332.864583333336 | 33.14 |
| 44332.875 | 33.02 |
| 44332.885416666664 | 32.94 |
| 44332.895833333336 | 32.89 |
| 44332.90625 | 32.83 |
| 44332.916666666664 | 32.79 |
| 44332.927083333336 | 32.76 |
| 44332.9375 | 32.74 |
| 44332.947916666664 | 32.76 |
| 44332.958333333336 | 32.83 |
| 44332.96875 | 32.84 |
| 44332.979166666664 | 32.86 |
| 44332.989583333336 | 32.93 |
| 44333.0 | 32.97 |
| 44333.010416666664 | 33.11 |
| 44333.020833333336 | 33.22 |
| 44333.03125 | 33.3 |
| 44333.041666666664 | 33.37 |
| 44333.052083333336 | 33.46 |
| 44333.0625 | 33.48 |
| 44333.072916666664 | 33.43 |
| 44333.083333333336 | 33.51 |
| 44333.09375 | 33.52 |
| 44333.104166666664 | 33.54 |
| 44333.114583333336 | 33.58 |
| 44333.125 | 33.56 |
| 44333.135416666664 | 33.58 |
| 44333.145833333336 | 33.57 |
| 44333.15625 | 33.56 |
| 44333.166666666664 | 33.57 |
| 44333.177083333336 | 33.55 |
| 44333.1875 | 33.51 |
| 44333.197916666664 | 33.57 |
| 44333.208333333336 | 33.52 |
| 44333.21875 | 33.5 |
| 44333.229166666664 | 33.54 |
| 44333.239583333336 | 33.55 |
| 44333.25 | 33.58 |
| 44333.260416666664 | 33.59 |
| 44333.270833333336 | 33.63 |
| 44333.28125 | 33.61 |
| 44333.291666666664 | 33.59 |
| 44333.302083333336 | 33.6 |
| 44333.3125 | 33.51 |
| 44333.322916666664 | 33.58 |
| 44333.333333333336 | 33.51 |
| 44333.34375 | 33.45 |
| 44333.354166666664 | 33.39 |
| 44333.364583333336 | 33.31 |
| 44333.375 | 33.22 |
| 44333.385416666664 | 33.12 |
| 44333.395833333336 | 33.07 |
| 44333.40625 | 32.96 |
| 44333.416666666664 | 32.86 |
| 44333.427083333336 | 32.79 |
| 44333.4375 | 32.72 |
| 44333.447916666664 | 32.7 |
| 44333.458333333336 | 32.65 |
| 44333.46875 | 32.63 |
| 44333.479166666664 | 32.66 |
| 44333.489583333336 | 32.69 |
| 44333.5 | 32.7 |
| 44333.510416666664 | 32.77 |
| 44333.520833333336 | 32.82 |
| 44333.53125 | 32.88 |
| 44333.541666666664 | 33.03 |
| 44333.552083333336 | 33.1 |
| 44333.5625 | 33.28 |
| 44333.572916666664 | 33.29 |
| 44333.583333333336 | 33.38 |
| 44333.59375 | 33.44 |
| 44333.604166666664 | 33.47 |
| 44333.614583333336 | 33.46 |
| 44333.625 | 33.5 |
| 44333.635416666664 | 33.53 |
| 44333.645833333336 | 33.58 |
| 44333.65625 | 33.6 |
| 44333.666666666664 | 33.62 |
| 44333.677083333336 | 33.58 |
| 44333.6875 | 33.58 |
| 44333.697916666664 | 33.59 |
| 44333.708333333336 | 33.61 |
| 44333.71875 | 33.6 |
| 44333.729166666664 | 33.44 |
| 44333.739583333336 | 33.65 |
| 44333.75 | 33.69 |
| 44333.760416666664 | 33.64 |
| 44333.770833333336 | 33.66 |
| 44333.78125 | 33.68 |
| 44333.791666666664 | 33.63 |
| 44333.802083333336 | 33.74 |
| 44333.8125 | 33.64 |
| 44333.822916666664 | 33.6 |
| 44333.833333333336 | 33.53 |
| 44333.84375 | 33.42 |
| 44333.854166666664 | 33.34 |
| 44333.864583333336 | 33.26 |
| 44333.875 | 33.28 |
| 44333.885416666664 | 33.18 |
| 44333.895833333336 | 33.1 |
| 44333.90625 | 33.08 |
| 44333.916666666664 | 32.97 |
| 44333.927083333336 | 32.9 |
| 44333.9375 | 32.86 |
| 44333.947916666664 | 32.84 |
| 44333.958333333336 | 32.81 |
| 44333.96875 | 32.82 |
| 44333.979166666664 | 32.93 |
| 44333.989583333336 | 32.96 |
| 44334.0 | 32.93 |
| 44334.010416666664 | 32.99 |
| 44334.020833333336 | 33 |
| 44334.03125 | 33.08 |
| 44334.041666666664 | 33.29 |
| 44334.052083333336 | 33.32 |
| 44334.0625 | 33.4 |
| 44334.072916666664 | 33.47 |
| 44334.083333333336 | 33.55 |
| 44334.09375 | 33.61 |
| 44334.104166666664 | 33.58 |
| 44334.114583333336 | 33.55 |
| 44334.125 | 33.65 |
| 44334.135416666664 | 33.6 |
| 44334.145833333336 | 33.6 |
| 44334.15625 | 33.63 |
| 44334.166666666664 | 33.62 |
| 44334.177083333336 | 33.61 |
| 44334.1875 | 33.6 |
| 44334.197916666664 | 33.61 |
| 44334.208333333336 | 33.62 |
| 44334.21875 | 33.63 |
| 44334.229166666664 | 33.61 |
| 44334.239583333336 | 33.59 |
| 44334.25 | 33.55 |
| 44334.260416666664 | 33.57 |
| 44334.270833333336 | 33.56 |
| 44334.28125 | 33.6 |
| 44334.291666666664 | 33.61 |
| 44334.302083333336 | 33.64 |
| 44334.3125 | 33.62 |
| 44334.322916666664 | 33.62 |
| 44334.333333333336 | 33.61 |
| 44334.34375 | 33.63 |
| 44334.354166666664 | 33.62 |
| 44334.364583333336 | 33.54 |
| 44334.375 | 33.47 |
| 44334.385416666664 | 33.46 |
| 44334.395833333336 | 33.39 |
| 44334.40625 | 33.35 |
| 44334.416666666664 | 33.23 |
| 44334.427083333336 | 33.2 |
| 44334.4375 | 32.98 |
| 44334.447916666664 | 32.88 |
| 44334.458333333336 | 32.81 |
| 44334.46875 | 32.74 |
| 44334.479166666664 | 32.72 |
| 44334.489583333336 | 32.66 |
| 44334.5 | 32.6 |
| 44334.510416666664 | 32.59 |
| 44334.520833333336 | 32.6 |
| 44334.53125 | 32.7 |
| 44334.541666666664 | 32.72 |
| 44334.552083333336 | 32.91 |
| 44334.5625 | 32.98 |
| 44334.572916666664 | 33.07 |
| 44334.583333333336 | 33.19 |
| 44334.59375 | 33.32 |
| 44334.604166666664 | 33.4 |
| 44334.614583333336 | 33.48 |
| 44334.625 | 33.53 |
| 44334.635416666664 | 33.59 |
| 44334.645833333336 | 33.6 |
| 44334.65625 | 33.64 |
| 44334.666666666664 | 33.66 |
| 44334.677083333336 | 33.68 |
| 44334.6875 | 33.7 |
| 44334.697916666664 | 33.71 |
| 44334.708333333336 | 33.73 |
| 44334.71875 | 33.73 |
| 44334.729166666664 | 33.73 |
| 44334.739583333336 | 33.75 |
| 44334.75 | 33.65 |
| 44334.760416666664 | 33.6 |
| 44334.770833333336 | 33.54 |
| 44334.78125 | 33.75 |
| 44334.791666666664 | 33.81 |
| 44334.802083333336 | 33.73 |
| 44334.8125 | 33.77 |
| 44334.822916666664 | 33.85 |
| 44334.833333333336 | 33.81 |
| 44334.84375 | 33.78 |
| 44334.854166666664 | 33.74 |
| 44334.864583333336 | 33.77 |
| 44334.875 | 33.72 |
| 44334.885416666664 | 33.61 |
| 44334.895833333336 | 33.53 |
| 44334.90625 | 33.53 |
| 44334.916666666664 | 33.38 |
| 44334.927083333336 | 33.26 |
| 44334.9375 | 33.15 |
| 44334.947916666664 | 33.16 |
| 44334.958333333336 | 33.08 |
| 44334.96875 | 33.01 |
| 44334.979166666664 | 32.98 |
| 44334.989583333336 | 32.98 |
| 44335.0 | 32.98 |
| 44335.010416666664 | 33.03 |
| 44335.020833333336 | 33.07 |
| 44335.03125 | 33.08 |
| 44335.041666666664 | 33.09 |
| 44335.052083333336 | 33.14 |
| 44335.0625 | 33.24 |
| 44335.072916666664 | 33.35 |
| 44335.083333333336 | 33.5 |
| 44335.09375 | 33.57 |
| 44335.104166666664 | 33.62 |
| 44335.114583333336 | 33.67 |
| 44335.125 | 33.73 |
| 44335.135416666664 | 33.75 |
| 44335.145833333336 | 33.78 |
| 44335.15625 | 33.8 |
| 44335.166666666664 | 33.82 |
| 44335.177083333336 | 33.84 |
| 44335.1875 | 33.85 |
| 44335.197916666664 | 33.87 |
| 44335.208333333336 | 33.89 |
| 44335.21875 | 33.9 |
| 44335.229166666664 | 33.9 |
| 44335.239583333336 | 33.9 |
| 44335.25 | 33.89 |
| 44335.260416666664 | 33.87 |
| 44335.270833333336 | 33.85 |
| 44335.28125 | 33.82 |
| 44335.291666666664 | 33.84 |
| 44335.302083333336 | 33.84 |
| 44335.3125 | 33.85 |
| 44335.322916666664 | 33.86 |
| 44335.333333333336 | 33.88 |
| 44335.34375 | 33.89 |
| 44335.354166666664 | 33.89 |
| 44335.364583333336 | 33.91 |
| 44335.375 | 33.88 |
| 44335.385416666664 | 33.88 |
| 44335.395833333336 | 33.79 |
| 44335.40625 | 33.74 |
| 44335.416666666664 | 33.62 |
| 44335.427083333336 | 33.51 |
| 44335.4375 | 33.38 |
| 44335.447916666664 | 33.28 |
| 44335.458333333336 | 33.2 |
| 44335.46875 | 33.08 |
| 44335.479166666664 | 32.97 |
| 44335.489583333336 | 32.95 |
| 44335.5 | 32.86 |
| 44335.510416666664 | 32.72 |
| 44335.520833333336 | 32.73 |
| 44335.53125 | 32.7 |
| 44335.541666666664 | 32.67 |
| 44335.552083333336 | 32.67 |
| 44335.5625 | 32.75 |
| 44335.572916666664 | 32.77 |
| 44335.583333333336 | 32.78 |
| 44335.59375 | 32.85 |
| 44335.604166666664 | 32.93 |
| 44335.614583333336 | 33.13 |
| 44335.625 | 33.3 |
| 44335.635416666664 | 33.43 |
| 44335.645833333336 | 33.51 |
| 44335.65625 | 33.57 |
| 44335.666666666664 | 33.64 |
| 44335.677083333336 | 33.7 |
| 44335.6875 | 33.74 |
| 44335.697916666664 | 33.78 |
| 44335.708333333336 | 33.8 |
| 44335.71875 | 33.82 |
| 44335.729166666664 | 33.84 |
| 44335.739583333336 | 33.86 |
| 44335.75 | 33.84 |
| 44335.760416666664 | 33.89 |
| 44335.770833333336 | 33.89 |
| 44335.78125 | 33.9 |
| 44335.791666666664 | 33.9 |
| 44335.802083333336 | 33.75 |
| 44335.8125 | 33.82 |
| 44335.822916666664 | 33.89 |
| 44335.833333333336 | 33.83 |
| 44335.84375 | 33.91 |
| 44335.854166666664 | 33.98 |
| 44335.864583333336 | 33.98 |
| 44335.875 | 33.95 |
| 44335.885416666664 | 33.93 |
| 44335.895833333336 | 33.89 |
| 44335.90625 | 33.9 |
| 44335.916666666664 | 33.83 |
| 44335.927083333336 | 33.65 |
| 44335.9375 | 33.56 |
| 44335.947916666664 | 33.41 |
| 44335.958333333336 | 33.33 |
| 44335.96875 | 33.21 |
| 44335.979166666664 | 33.06 |
| 44335.989583333336 | 33 |
| 44336.0 | 32.89 |
| 44336.010416666664 | 32.86 |
| 44336.020833333336 | 32.83 |
| 44336.03125 | 32.81 |
| 44336.041666666664 | 32.8 |
| 44336.052083333336 | 32.8 |
| 44336.0625 | 32.85 |
| 44336.072916666664 | 32.87 |
| 44336.083333333336 | 32.93 |
| 44336.09375 | 33.05 |
| 44336.104166666664 | 33.13 |
| 44336.114583333336 | 33.31 |
| 44336.125 | 33.55 |
| 44336.135416666664 | 33.67 |
| 44336.145833333336 | 33.73 |
| 44336.15625 | 33.77 |
| 44336.166666666664 | 33.83 |
| 44336.177083333336 | 33.88 |
| 44336.1875 | 33.91 |
| 44336.197916666664 | 33.94 |
| 44336.208333333336 | 33.95 |
| 44336.21875 | 33.97 |
| 44336.229166666664 | 33.99 |
| 44336.239583333336 | 34.03 |
| 44336.25 | 34.05 |
| 44336.260416666664 | 34.07 |
| 44336.270833333336 | 34.06 |
| 44336.28125 | 34.04 |
| 44336.291666666664 | 34.03 |
| 44336.302083333336 | 34 |
| 44336.3125 | 33.98 |
| 44336.322916666664 | 33.96 |
| 44336.333333333336 | 33.95 |
| 44336.34375 | 33.97 |
| 44336.354166666664 | 33.98 |
| 44336.364583333336 | 34 |
| 44336.375 | 34.04 |
| 44336.385416666664 | 34.06 |
| 44336.395833333336 | 34.05 |
| 44336.40625 | 34.07 |
| 44336.416666666664 | 34.08 |
| 44336.427083333336 | 34.05 |
| 44336.4375 | 34.03 |
| 44336.447916666664 | 33.91 |
| 44336.458333333336 | 33.9 |
| 44336.46875 | 33.77 |
| 44336.479166666664 | 33.67 |
| 44336.489583333336 | 33.58 |
| 44336.5 | 33.51 |
| 44336.510416666664 | 33.41 |
| 44336.520833333336 | 33.33 |
| 44336.53125 | 33.23 |
| 44336.541666666664 | 33.12 |
| 44336.552083333336 | 33.04 |
| 44336.5625 | 32.98 |
| 44336.572916666664 | 33 |
| 44336.583333333336 | 33 |
| 44336.59375 | 33.08 |
| 44336.604166666664 | 33.12 |
| 44336.614583333336 | 33.15 |
| 44336.625 | 33.22 |
| 44336.635416666664 | 33.3 |
| 44336.645833333336 | 33.36 |
| 44336.65625 | 33.44 |
| 44336.666666666664 | 33.57 |
| 44336.677083333336 | 33.67 |
| 44336.6875 | 33.72 |
| 44336.697916666664 | 33.77 |
| 44336.708333333336 | 33.84 |
| 44336.71875 | 33.86 |
| 44336.729166666664 | 33.89 |
| 44336.739583333336 | 33.93 |
| 44336.75 | 33.95 |
| 44336.760416666664 | 33.99 |
| 44336.770833333336 | 34.02 |
| 44336.78125 | 34.05 |
| 44336.791666666664 | 34.06 |
| 44336.802083333336 | 34.06 |
| 44336.8125 | 34.06 |
| 44336.822916666664 | 33.93 |
| 44336.833333333336 | 33.9 |
| 44336.84375 | 33.84 |
| 44336.854166666664 | 33.87 |
| 44336.864583333336 | 34.1 |
| 44336.875 | 34.12 |
| 44336.885416666664 | 34.15 |
| 44336.895833333336 | 34.16 |
| 44336.90625 | 34.19 |
| 44336.916666666664 | 34.17 |
| 44336.927083333336 | 34.22 |
| 44336.9375 | 34.24 |
| 44336.947916666664 | 34.25 |
| 44336.958333333336 | 34.17 |
| 44336.96875 | 34.04 |
| 44336.979166666664 | 33.94 |
| 44336.989583333336 | 33.85 |
| 44337.0 | 33.77 |
| 44337.010416666664 | 33.7 |
| 44337.020833333336 | 33.62 |
| 44337.03125 | 33.55 |
| 44337.041666666664 | 33.47 |
| 44337.052083333336 | 33.4 |
| 44337.0625 | 33.31 |
| 44337.072916666664 | 33.27 |
| 44337.083333333336 | 33.24 |
| 44337.09375 | 33.22 |
| 44337.104166666664 | 33.23 |
| 44337.114583333336 | 33.31 |
| 44337.125 | 33.3 |
| 44337.135416666664 | 33.3 |
| 44337.145833333336 | 33.37 |
| 44337.15625 | 33.45 |
| 44337.166666666664 | 33.53 |
| 44337.177083333336 | 33.64 |
| 44337.1875 | 33.73 |
| 44337.197916666664 | 33.86 |
| 44337.208333333336 | 33.91 |
| 44337.21875 | 33.96 |
| 44337.229166666664 | 34.01 |
| 44337.239583333336 | 34.04 |
| 44337.25 | 34.09 |
| 44337.260416666664 | 34.11 |
| 44337.270833333336 | 34.12 |
| 44337.28125 | 34.13 |
| 44337.291666666664 | 34.12 |
| 44337.302083333336 | 34.11 |
| 44337.3125 | 34.09 |
| 44337.322916666664 | 34.03 |
| 44337.333333333336 | 33.94 |
| 44337.34375 | 33.95 |
| 44337.354166666664 | 33.93 |
| 44337.364583333336 | 33.93 |
| 44337.375 | 33.96 |
| 44337.385416666664 | 33.94 |
| 44337.395833333336 | 33.94 |
| 44337.40625 | 33.94 |
| 44337.416666666664 | 33.98 |
| 44337.427083333336 | 34.06 |
| 44337.4375 | 34.07 |
| 44337.447916666664 | 34.11 |
| 44337.458333333336 | 34.09 |
| 44337.46875 | 34.13 |
| 44337.479166666664 | 34.11 |
| 44337.489583333336 | 34.02 |
| 44337.5 | 34 |
| 44337.510416666664 | 33.95 |
| 44337.520833333336 | 33.88 |
| 44337.53125 | 33.82 |
| 44337.541666666664 | 33.77 |
| 44337.552083333336 | 33.69 |
| 44337.5625 | 33.6 |
| 44337.572916666664 | 33.49 |
| 44337.583333333336 | 33.44 |
| 44337.59375 | 33.37 |
| 44337.604166666664 | 33.31 |
| 44337.614583333336 | 33.28 |
| 44337.625 | 33.27 |
| 44337.635416666664 | 33.32 |
| 44337.645833333336 | 33.37 |
| 44337.65625 | 33.38 |
| 44337.666666666664 | 33.4 |
| 44337.677083333336 | 33.46 |
| 44337.6875 | 33.57 |
| 44337.697916666664 | 33.64 |
| 44337.708333333336 | 33.7 |
| 44337.71875 | 33.79 |
| 44337.729166666664 | 33.86 |
| 44337.739583333336 | 33.92 |
| 44337.75 | 33.94 |
| 44337.760416666664 | 33.97 |
| 44337.770833333336 | 34.01 |
| 44337.78125 | 34.04 |
| 44337.791666666664 | 34.08 |
| 44337.802083333336 | 34.08 |
| 44337.8125 | 34.07 |
| 44337.822916666664 | 34.05 |
| 44337.833333333336 | 34.05 |
| 44337.84375 | 34.03 |
| 44337.854166666664 | 34.04 |
| 44337.864583333336 | 34.04 |
| 44337.875 | 33.99 |
| 44337.885416666664 | 33.97 |
| 44337.895833333336 | 34.03 |
| 44337.90625 | 34.07 |
| 44337.916666666664 | 34.1 |
| 44337.927083333336 | 34.1 |
| 44337.9375 | 34.14 |
| 44337.947916666664 | 34.09 |
| 44337.958333333336 | 34.12 |
| 44337.96875 | 34.12 |
| 44337.979166666664 | 34.18 |
| 44337.989583333336 | 34.21 |
| 44338.0 | 34.21 |
| 44338.010416666664 | 34.23 |
| 44338.020833333336 | 34.15 |
| 44338.03125 | 34.1 |
| 44338.041666666664 | 34.04 |
| 44338.052083333336 | 34.03 |
| 44338.0625 | 33.91 |
| 44338.072916666664 | 33.84 |
| 44338.083333333336 | 33.81 |
| 44338.09375 | 33.64 |
| 44338.104166666664 | 33.62 |
| 44338.114583333336 | 33.55 |
| 44338.125 | 33.47 |
| 44338.135416666664 | 33.48 |
| 44338.145833333336 | 33.49 |
| 44338.15625 | 33.59 |
| 44338.166666666664 | 33.51 |
| 44338.177083333336 | 33.56 |
| 44338.1875 | 33.61 |
| 44338.197916666664 | 33.68 |
| 44338.208333333336 | 33.78 |
| 44338.21875 | 33.84 |
| 44338.229166666664 | 33.88 |
| 44338.239583333336 | 33.93 |
| 44338.25 | 33.96 |
| 44338.260416666664 | 33.99 |
| 44338.270833333336 | 34.02 |
| 44338.28125 | 34.04 |
| 44338.291666666664 | 34.07 |
| 44338.302083333336 | 34.09 |
| 44338.3125 | 34.1 |
| 44338.322916666664 | 34.11 |
| 44338.333333333336 | 34.12 |
| 44338.34375 | 34.11 |
| 44338.354166666664 | 34.11 |
| 44338.364583333336 | 34.09 |
| 44338.375 | 34.09 |
| 44338.385416666664 | 34.08 |
| 44338.395833333336 | 34.08 |
| 44338.40625 | 34.09 |
| 44338.416666666664 | 34.05 |
| 44338.427083333336 | 34.05 |
| 44338.4375 | 34.04 |
| 44338.447916666664 | 34.06 |
| 44338.458333333336 | 34.09 |
| 44338.46875 | 34.1 |
| 44338.479166666664 | 34.08 |
| 44338.489583333336 | 34.1 |
| 44338.5 | 34.15 |
| 44338.510416666664 | 34.07 |
| 44338.520833333336 | 34.02 |
| 44338.53125 | 34 |
| 44338.541666666664 | 33.97 |
| 44338.552083333336 | 33.83 |
| 44338.5625 | 33.75 |
| 44338.572916666664 | 33.72 |
| 44338.583333333336 | 33.58 |
| 44338.59375 | 33.43 |
| 44338.604166666664 | 33.43 |
| 44338.614583333336 | 33.41 |
| 44338.625 | 33.34 |
| 44338.635416666664 | 33.32 |
| 44338.645833333336 | 33.3 |
| 44338.65625 | 33.35 |
| 44338.666666666664 | 33.36 |
| 44338.677083333336 | 33.35 |
| 44338.6875 | 33.31 |
| 44338.697916666664 | 33.34 |
| 44338.708333333336 | 33.4 |
| 44338.71875 | 33.51 |
| 44338.729166666664 | 33.67 |
| 44338.739583333336 | 33.76 |
| 44338.75 | 33.85 |
| 44338.760416666664 | 33.94 |
| 44338.770833333336 | 34.01 |
| 44338.78125 | 34.08 |
| 44338.791666666664 | 34.09 |
| 44338.802083333336 | 34.13 |
| 44338.8125 | 34.13 |
| 44338.822916666664 | 34.15 |
| 44338.833333333336 | 34.16 |
| 44338.84375 | 34.18 |
| 44338.854166666664 | 34.18 |
| 44338.864583333336 | 34.17 |
| 44338.875 | 34.16 |
| 44338.885416666664 | 34.15 |
| 44338.895833333336 | 34.16 |
| 44338.90625 | 34.16 |
| 44338.916666666664 | 34.16 |
| 44338.927083333336 | 34.17 |
| 44338.9375 | 34.17 |
| 44338.947916666664 | 34.18 |
| 44338.958333333336 | 34.11 |
| 44338.96875 | 34.15 |
| 44338.979166666664 | 34.21 |
| 44338.989583333336 | 34.26 |
| 44339.0 | 34.24 |
| 44339.010416666664 | 34.23 |
| 44339.020833333336 | 34.27 |
| 44339.03125 | 34.3 |
| 44339.041666666664 | 34.34 |
| 44339.052083333336 | 34.35 |
| 44339.0625 | 34.36 |
| 44339.072916666664 | 34.24 |
| 44339.083333333336 | 34.23 |
| 44339.09375 | 34.02 |
| 44339.104166666664 | 33.95 |
| 44339.114583333336 | 33.86 |
| 44339.125 | 33.78 |
| 44339.135416666664 | 33.66 |
| 44339.145833333336 | 33.58 |
| 44339.15625 | 33.45 |
| 44339.166666666664 | 33.43 |
| 44339.177083333336 | 33.38 |
| 44339.1875 | 33.45 |
| 44339.197916666664 | 33.54 |
| 44339.208333333336 | 33.49 |
| 44339.21875 | 33.52 |
| 44339.229166666664 | 33.59 |
| 44339.239583333336 | 33.66 |
| 44339.25 | 33.79 |
| 44339.260416666664 | 33.92 |
| 44339.270833333336 | 34.01 |
| 44339.28125 | 34.08 |
| 44339.291666666664 | 34.12 |
| 44339.302083333336 | 34.14 |
| 44339.3125 | 34.17 |
| 44339.322916666664 | 34.2 |
| 44339.333333333336 | 34.22 |
| 44339.34375 | 34.23 |
| 44339.354166666664 | 34.23 |
| 44339.364583333336 | 34.23 |
| 44339.375 | 34.22 |
| 44339.385416666664 | 34.18 |
| 44339.395833333336 | 34.15 |
| 44339.40625 | 34.11 |
| 44339.416666666664 | 34.1 |
| 44339.427083333336 | 34.09 |
| 44339.4375 | 34.12 |
| 44339.447916666664 | 34.13 |
| 44339.458333333336 | 34.03 |
| 44339.46875 | 34.06 |
| 44339.479166666664 | 34.12 |
| 44339.489583333336 | 34.14 |
| 44339.5 | 34.17 |
| 44339.510416666664 | 34.19 |
| 44339.520833333336 | 34.19 |
| 44339.53125 | 34.24 |
| 44339.541666666664 | 34.21 |
| 44339.552083333336 | 34.26 |
| 44339.5625 | 34.24 |
| 44339.572916666664 | 34.22 |
| 44339.583333333336 | 34.18 |
| 44339.59375 | 34.14 |
| 44339.604166666664 | 34.04 |
| 44339.614583333336 | 33.97 |
| 44339.625 | 33.86 |
| 44339.635416666664 | 33.74 |
| 44339.645833333336 | 33.58 |
| 44339.65625 | 33.62 |
| 44339.666666666664 | 33.46 |
| 44339.677083333336 | 33.53 |
| 44339.6875 | 33.47 |
| 44339.697916666664 | 33.56 |
| 44339.708333333336 | 33.56 |
| 44339.71875 | 33.45 |
| 44339.729166666664 | 33.47 |
| 44339.739583333336 | 33.55 |
| 44339.75 | 33.66 |
| 44339.760416666664 | 33.88 |
| 44339.770833333336 | 33.98 |
| 44339.78125 | 34.05 |
| 44339.791666666664 | 34.12 |
| 44339.802083333336 | 34.13 |
| 44339.8125 | 34.16 |
| 44339.822916666664 | 34.17 |
| 44339.833333333336 | 34.2 |
| 44339.84375 | 34.22 |
| 44339.854166666664 | 34.23 |
| 44339.864583333336 | 34.21 |
| 44339.875 | 34.18 |
| 44339.885416666664 | 34.16 |
| 44339.895833333336 | 34.14 |
| 44339.90625 | 34.16 |
| 44339.916666666664 | 34.17 |
| 44339.927083333336 | 34.18 |
| 44339.9375 | 34.18 |
| 44339.947916666664 | 34.17 |
| 44339.958333333336 | 34.17 |
| 44339.96875 | 34.17 |
| 44339.979166666664 | 34.17 |
| 44339.989583333336 | 34.19 |
| 44340.0 | 34.16 |
| 44340.010416666664 | 34.23 |
| 44340.020833333336 | 34.23 |
| 44340.03125 | 34.23 |
| 44340.041666666664 | 34.23 |
| 44340.052083333336 | 34.25 |
| 44340.0625 | 34.37 |
| 44340.072916666664 | 34.37 |
| 44340.083333333336 | 34.5 |
| 44340.09375 | 34.5 |
| 44340.104166666664 | 34.51 |
| 44340.114583333336 | 34.46 |
| 44340.125 | 34.37 |
| 44340.135416666664 | 34.33 |
| 44340.145833333336 | 34.26 |
| 44340.15625 | 34.06 |
| 44340.166666666664 | 33.98 |
| 44340.177083333336 | 33.93 |
| 44340.1875 | 33.82 |
| 44340.197916666664 | 33.74 |
| 44340.208333333336 | 33.71 |
| 44340.21875 | 33.7 |
| 44340.229166666664 | 33.67 |
| 44340.239583333336 | 33.73 |
| 44340.25 | 33.76 |
| 44340.260416666664 | 33.73 |
| 44340.270833333336 | 33.75 |
| 44340.28125 | 33.79 |
| 44340.291666666664 | 33.88 |
| 44340.302083333336 | 33.97 |
| 44340.3125 | 34.02 |
| 44340.322916666664 | 34.13 |
| 44340.333333333336 | 34.14 |
| 44340.34375 | 34.17 |
| 44340.354166666664 | 34.18 |
| 44340.364583333336 | 34.2 |
| 44340.375 | 34.22 |
| 44340.385416666664 | 34.23 |
| 44340.395833333336 | 34.23 |
| 44340.40625 | 34.23 |
| 44340.416666666664 | 34.21 |
| 44340.427083333336 | 34.18 |
| 44340.4375 | 34.09 |
| 44340.447916666664 | 34 |
| 44340.458333333336 | 33.97 |
| 44340.46875 | 34.03 |
| 44340.479166666664 | 34.05 |
| 44340.489583333336 | 33.93 |
| 44340.5 | 34.13 |
| 44340.510416666664 | 34.02 |
| 44340.520833333336 | 34.08 |
| 44340.53125 | 34.14 |
| 44340.541666666664 | 34.19 |
| 44340.552083333336 | 34.26 |
| 44340.5625 | 34.27 |
| 44340.572916666664 | 34.24 |
| 44340.583333333336 | 34.22 |
| 44340.59375 | 34.2 |
| 44340.604166666664 | 34.07 |
| 44340.614583333336 | 34.18 |
| 44340.625 | 34.17 |
| 44340.635416666664 | 34.21 |
| 44340.645833333336 | 34.13 |
| 44340.65625 | 34.12 |
| 44340.666666666664 | 34.14 |
| 44340.677083333336 | 34.11 |
| 44340.6875 | 34.1 |
| 44340.697916666664 | 33.98 |
| 44340.708333333336 | 33.92 |
| 44340.71875 | 33.87 |
| 44340.729166666664 | 33.86 |
| 44340.739583333336 | 33.85 |
| 44340.75 | 33.86 |
| 44340.760416666664 | 33.88 |
| 44340.770833333336 | 33.88 |
| 44340.78125 | 33.88 |
| 44340.791666666664 | 33.93 |
| 44340.802083333336 | 33.97 |
| 44340.8125 | 34.02 |
| 44340.822916666664 | 34.04 |
| 44340.833333333336 | 34.05 |
| 44340.84375 | 34.06 |
| 44340.854166666664 | 34.04 |
| 44340.864583333336 | 34 |
| 44340.875 | 33.94 |
| 44340.885416666664 | 33.97 |
| 44340.895833333336 | 33.96 |
| 44340.90625 | 33.96 |
| 44340.916666666664 | 33.91 |
| 44340.927083333336 | 33.83 |
| 44340.9375 | 33.82 |
| 44340.947916666664 | 33.77 |
| 44340.958333333336 | 33.8 |
| 44340.96875 | 33.79 |
| 44340.979166666664 | 33.8 |
| 44340.989583333336 | 33.81 |
| 44341.0 | 33.83 |
| 44341.010416666664 | 33.84 |
| 44341.020833333336 | 33.86 |
| 44341.03125 | 33.88 |
| 44341.041666666664 | 33.91 |
| 44341.052083333336 | 33.88 |
| 44341.0625 | 33.88 |
| 44341.072916666664 | 33.9 |
| 44341.083333333336 | 33.9 |
| 44341.09375 | 33.96 |
| 44341.104166666664 | 33.96 |
| 44341.114583333336 | 34.01 |
| 44341.125 | 34.04 |
| 44341.135416666664 | 33.99 |
| 44341.145833333336 | 34.07 |
| 44341.15625 | 34.09 |
| 44341.166666666664 | 34.12 |
| 44341.177083333336 | 34.14 |
| 44341.1875 | 34.2 |
| 44341.197916666664 | 34.18 |
| 44341.208333333336 | 34.14 |
| 44341.21875 | 34.11 |
| 44341.229166666664 | 34.06 |
| 44341.239583333336 | 34.02 |
| 44341.25 | 33.98 |
| 44341.260416666664 | 33.95 |
| 44341.270833333336 | 33.93 |
| 44341.28125 | 33.94 |
| 44341.291666666664 | 33.98 |
| 44341.302083333336 | 33.94 |
| 44341.3125 | 33.96 |
| 44341.322916666664 | 33.99 |
| 44341.333333333336 | 34.03 |
| 44341.34375 | 34.05 |
| 44341.354166666664 | 34.06 |
| 44341.364583333336 | 34.07 |
| 44341.375 | 34.08 |
| 44341.385416666664 | 34.08 |
| 44341.395833333336 | 34.09 |
| 44341.40625 | 34.05 |
| 44341.416666666664 | 34.05 |
| 44341.427083333336 | 34.05 |
| 44341.4375 | 34.05 |
| 44341.447916666664 | 34.05 |
| 44341.458333333336 | 34.03 |
| 44341.46875 | 33.99 |
| 44341.479166666664 | 33.93 |
| 44341.489583333336 | 33.92 |
| 44341.5 | 33.89 |
| 44341.510416666664 | 33.87 |
| 44341.520833333336 | 33.85 |
| 44341.53125 | 33.84 |
| 44341.541666666664 | 33.86 |
| 44341.552083333336 | 33.89 |
| 44341.5625 | 33.89 |
| 44341.572916666664 | 33.94 |
| 44341.583333333336 | 33.98 |
| 44341.59375 | 34.02 |
| 44341.604166666664 | 34.03 |
| 44341.614583333336 | 34.09 |
| 44341.625 | 34.12 |
| 44341.635416666664 | 34.11 |
| 44341.645833333336 | 34.12 |
| 44341.65625 | 34.11 |
| 44341.666666666664 | 34.1 |
| 44341.677083333336 | 34.12 |
| 44341.6875 | 34.12 |
| 44341.697916666664 | 34.08 |
| 44341.708333333336 | 34.1 |
| 44341.71875 | 34.09 |
| 44341.729166666664 | 34.04 |
| 44341.739583333336 | 33.99 |
| 44341.75 | 33.96 |
| 44341.760416666664 | 33.95 |
| 44341.770833333336 | 33.92 |
| 44341.78125 | 33.93 |
| 44341.791666666664 | 33.94 |
| 44341.802083333336 | 33.91 |
| 44341.8125 | 33.94 |
| 44341.822916666664 | 33.99 |
| 44341.833333333336 | 34.03 |
| 44341.84375 | 34.04 |
| 44341.854166666664 | 34.05 |
| 44341.864583333336 | 34.05 |
| 44341.875 | 34.05 |
| 44341.885416666664 | 34.05 |
| 44341.895833333336 | 34.05 |
| 44341.90625 | 34.06 |
| 44341.916666666664 | 34.05 |
| 44341.927083333336 | 34.06 |
| 44341.9375 | 34.04 |
| 44341.947916666664 | 34.01 |
| 44341.958333333336 | 33.94 |
| 44341.96875 | 33.91 |
| 44341.979166666664 | 33.92 |
| 44341.989583333336 | 33.96 |
| 44342.0 | 34.01 |
| 44342.010416666664 | 34.08 |
| 44342.020833333336 | 34.07 |
| 44342.03125 | 34.07 |
| 44342.041666666664 | 34.05 |
| 44342.052083333336 | 34.05 |
| 44342.0625 | 34.02 |
| 44342.072916666664 | 34.02 |
| 44342.083333333336 | 34.03 |
| 44342.09375 | 34.01 |
| 44342.104166666664 | 34 |
| 44342.114583333336 | 34.01 |
| 44342.125 | 34.03 |
| 44342.135416666664 | 34.06 |
| 44342.145833333336 | 34.07 |
| 44342.15625 | 34.09 |
| 44342.166666666664 | 34.1 |
| 44342.177083333336 | 34.08 |
| 44342.1875 | 34.08 |
| 44342.197916666664 | 34.09 |
| 44342.208333333336 | 34.04 |
| 44342.21875 | 34.06 |
| 44342.229166666664 | 34.03 |
| 44342.239583333336 | 34.04 |
| 44342.25 | 34.01 |
| 44342.260416666664 | 33.99 |
| 44342.270833333336 | 33.92 |
| 44342.28125 | 33.86 |
| 44342.291666666664 | 33.81 |
| 44342.302083333336 | 33.79 |
| 44342.3125 | 33.78 |
| 44342.322916666664 | 33.81 |
| 44342.333333333336 | 33.83 |
| 44342.34375 | 33.79 |
| 44342.354166666664 | 33.82 |
| 44342.364583333336 | 33.85 |
| 44342.375 | 33.89 |
| 44342.385416666664 | 33.91 |
| 44342.395833333336 | 33.94 |
| 44342.40625 | 33.96 |
| 44342.416666666664 | 33.98 |
| 44342.427083333336 | 34 |
| 44342.4375 | 34.01 |
| 44342.447916666664 | 34.01 |
| 44342.458333333336 | 33.98 |
| 44342.46875 | 34.01 |
| 44342.479166666664 | 34.03 |
| 44342.489583333336 | 34.04 |
| 44342.5 | 34.04 |
| 44342.510416666664 | 34.01 |
| 44342.520833333336 | 33.97 |
| 44342.53125 | 33.93 |
| 44342.541666666664 | 33.92 |
| 44342.552083333336 | 33.91 |
| 44342.5625 | 33.93 |
| 44342.572916666664 | 33.92 |
| 44342.583333333336 | 33.92 |
| 44342.59375 | 34 |
| 44342.604166666664 | 34.02 |
| 44342.614583333336 | 33.99 |
| 44342.625 | 34 |
| 44342.635416666664 | 34.02 |
| 44342.645833333336 | 34.03 |
| 44342.65625 | 33.99 |
| 44342.666666666664 | 33.94 |
| 44342.677083333336 | 33.96 |
| 44342.6875 | 33.96 |
| 44342.697916666664 | 33.96 |
| 44342.708333333336 | 33.96 |
| 44342.71875 | 33.93 |
| 44342.729166666664 | 33.91 |
| 44342.739583333336 | 33.89 |
| 44342.75 | 33.86 |
| 44342.760416666664 | 33.81 |
| 44342.770833333336 | 33.8 |
| 44342.78125 | 33.75 |
| 44342.791666666664 | 33.74 |
| 44342.802083333336 | 33.69 |
| 44342.8125 | 33.72 |
| 44342.822916666664 | 33.76 |
| 44342.833333333336 | 33.71 |
| 44342.84375 | 33.75 |
| 44342.854166666664 | 33.83 |
| 44342.864583333336 | 33.9 |
| 44342.875 | 33.98 |
| 44342.885416666664 | 34.02 |
| 44342.895833333336 | 34.09 |
| 44342.90625 | 34.18 |
| 44342.916666666664 | 34.23 |
| 44342.927083333336 | 34.26 |
| 44342.9375 | 34.22 |
| 44342.947916666664 | 34.26 |
| 44342.958333333336 | 34.36 |
| 44342.96875 | 34.35 |
| 44342.979166666664 | 34.3 |
| 44342.989583333336 | 34.28 |
| 44343.0 | 34.3 |
| 44343.010416666664 | 34.34 |
| 44343.020833333336 | 34.36 |
| 44343.03125 | 34.33 |
| 44343.041666666664 | 34.31 |
| 44343.052083333336 | 34.27 |
| 44343.0625 | 34.16 |
| 44343.072916666664 | 34.19 |
| 44343.083333333336 | 34.17 |
| 44343.09375 | 34.25 |
| 44343.104166666664 | 34.21 |
| 44343.114583333336 | 34.18 |
| 44343.125 | 34.2 |
| 44343.135416666664 | 34.27 |
| 44343.145833333336 | 34.25 |
| 44343.15625 | 34.33 |
| 44343.166666666664 | 34.33 |
| 44343.177083333336 | 34.37 |
| 44343.1875 | 34.41 |
| 44343.197916666664 | 34.44 |
| 44343.208333333336 | 34.42 |
| 44343.21875 | 34.38 |
| 44343.229166666664 | 34.37 |
| 44343.239583333336 | 34.29 |
| 44343.25 | 34.27 |
| 44343.260416666664 | 34.21 |
| 44343.270833333336 | 34.14 |
| 44343.28125 | 34.13 |
| 44343.291666666664 | 34 |
| 44343.302083333336 | 33.86 |
| 44343.3125 | 33.77 |
| 44343.322916666664 | 33.76 |
| 44343.333333333336 | 33.75 |
| 44343.34375 | 33.75 |
| 44343.354166666664 | 33.72 |
| 44343.364583333336 | 33.74 |
| 44343.375 | 33.75 |
| 44343.385416666664 | 33.68 |
| 44343.395833333336 | 33.74 |
| 44343.40625 | 33.78 |
| 44343.416666666664 | 33.85 |
| 44343.427083333336 | 33.92 |
| 44343.4375 | 34.01 |
| 44343.447916666664 | 34.12 |
| 44343.458333333336 | 34.13 |
| 44343.46875 | 34.13 |
| 44343.479166666664 | 34.14 |
| 44343.489583333336 | 34.14 |
| 44343.5 | 34.14 |
| 44343.510416666664 | 34.13 |
| 44343.520833333336 | 34.15 |
| 44343.53125 | 34.14 |
| 44343.541666666664 | 34.1 |
| 44343.552083333336 | 34.01 |
| 44343.5625 | 34.01 |
| 44343.572916666664 | 33.97 |
| 44343.583333333336 | 33.96 |
| 44343.59375 | 34.04 |
| 44343.604166666664 | 33.98 |
| 44343.614583333336 | 34 |
| 44343.625 | 34.04 |
| 44343.635416666664 | 34.04 |
| 44343.645833333336 | 34.09 |
| 44343.65625 | 34.07 |
| 44343.666666666664 | 34.06 |
| 44343.677083333336 | 34.1 |
| 44343.6875 | 34.1 |
| 44343.697916666664 | 34.04 |
| 44343.708333333336 | 34 |
| 44343.71875 | 33.98 |
| 44343.729166666664 | 33.97 |
| 44343.739583333336 | 33.95 |
| 44343.75 | 33.89 |
| 44343.760416666664 | 33.78 |
| 44343.770833333336 | 33.71 |
| 44343.78125 | 33.59 |
| 44343.791666666664 | 33.42 |
| 44343.802083333336 | 33.3 |
| 44343.8125 | 33.16 |
| 44343.822916666664 | 33.18 |
| 44343.833333333336 | 33.15 |
| 44343.84375 | 33.03 |
| 44343.854166666664 | 33.22 |
| 44343.864583333336 | 33.09 |
| 44343.875 | 33.1 |
| 44343.885416666664 | 33.22 |
| 44343.895833333336 | 33.31 |
| 44343.90625 | 33.54 |
| 44343.916666666664 | 33.65 |
| 44343.927083333336 | 33.81 |
| 44343.9375 | 33.92 |
| 44343.947916666664 | 33.97 |
| 44343.958333333336 | 34 |
| 44343.96875 | 34.03 |
| 44343.979166666664 | 34.1 |
| 44343.989583333336 | 34.06 |
| 44344.0 | 34.02 |
| 44344.010416666664 | 33.89 |
| 44344.020833333336 | 33.91 |
| 44344.03125 | 33.91 |
| 44344.041666666664 | 33.98 |
| 44344.052083333336 | 34.08 |
| 44344.0625 | 34.1 |
| 44344.072916666664 | 34.09 |
| 44344.083333333336 | 34.06 |
| 44344.09375 | 34.03 |
| 44344.104166666664 | 34.01 |
| 44344.114583333336 | 34.03 |
| 44344.125 | 33.97 |
| 44344.135416666664 | 33.94 |
| 44344.145833333336 | 33.91 |
| 44344.15625 | 33.94 |
| 44344.166666666664 | 33.96 |
| 44344.177083333336 | 34 |
| 44344.1875 | 34 |
| 44344.197916666664 | 34.04 |
| 44344.208333333336 | 34.05 |
| 44344.21875 | 34.07 |
| 44344.229166666664 | 34.1 |
| 44344.239583333336 | 34.09 |
| 44344.25 | 34.06 |
| 44344.260416666664 | 34 |
| 44344.270833333336 | 34.02 |
| 44344.28125 | 33.93 |
| 44344.291666666664 | 33.87 |
| 44344.302083333336 | 33.79 |
| 44344.3125 | 33.73 |
| 44344.322916666664 | 33.59 |
| 44344.333333333336 | 33.48 |
| 44344.34375 | 33.38 |
| 44344.354166666664 | 33.29 |
| 44344.364583333336 | 33.21 |
| 44344.375 | 33.17 |
| 44344.385416666664 | 33.19 |
| 44344.395833333336 | 33.24 |
| 44344.40625 | 33.24 |
| 44344.416666666664 | 33.25 |
| 44344.427083333336 | 33.31 |
| 44344.4375 | 33.4 |
| 44344.447916666664 | 33.52 |
| 44344.458333333336 | 33.62 |
| 44344.46875 | 33.73 |
| 44344.479166666664 | 33.79 |
| 44344.489583333336 | 33.83 |
| 44344.5 | 33.85 |
| 44344.510416666664 | 33.89 |
| 44344.520833333336 | 33.91 |
| 44344.53125 | 33.93 |
| 44344.541666666664 | 33.9 |
| 44344.552083333336 | 33.92 |
| 44344.5625 | 33.87 |
| 44344.572916666664 | 33.84 |
| 44344.583333333336 | 33.78 |
| 44344.59375 | 33.77 |
| 44344.604166666664 | 33.76 |
| 44344.614583333336 | 33.75 |
| 44344.625 | 33.77 |
| 44344.635416666664 | 33.77 |
| 44344.645833333336 | 33.78 |
| 44344.65625 | 33.79 |
| 44344.666666666664 | 33.83 |
| 44344.677083333336 | 33.89 |
| 44344.6875 | 33.91 |
| 44344.697916666664 | 33.95 |
| 44344.708333333336 | 33.87 |
| 44344.71875 | 33.93 |
| 44344.729166666664 | 33.92 |
| 44344.739583333336 | 33.92 |
| 44344.75 | 33.94 |
| 44344.760416666664 | 33.89 |
| 44344.770833333336 | 33.84 |
| 44344.78125 | 33.88 |
| 44344.791666666664 | 33.89 |
| 44344.802083333336 | 33.88 |
| 44344.8125 | 33.81 |
| 44344.822916666664 | 33.81 |
| 44344.833333333336 | 33.64 |
| 44344.84375 | 33.53 |
| 44344.854166666664 | 33.43 |
| 44344.864583333336 | 33.38 |
| 44344.875 | 33.35 |
| 44344.885416666664 | 33.44 |
| 44344.895833333336 | 33.46 |
| 44344.90625 | 33.48 |
| 44344.916666666664 | 33.57 |
| 44344.927083333336 | 33.62 |
| 44344.9375 | 33.7 |
| 44344.947916666664 | 33.76 |
| 44344.958333333336 | 33.81 |
| 44344.96875 | 33.82 |
| 44344.979166666664 | 33.85 |
| 44344.989583333336 | 33.84 |
| 44345.0 | 33.9 |
| 44345.010416666664 | 33.93 |
| 44345.020833333336 | 33.93 |
| 44345.03125 | 33.85 |
| 44345.041666666664 | 33.86 |
| 44345.052083333336 | 33.84 |
| 44345.0625 | 33.83 |
| 44345.072916666664 | 33.89 |
| 44345.083333333336 | 34 |
| 44345.09375 | 34.05 |
| 44345.104166666664 | 34.04 |
| 44345.114583333336 | 34.03 |
| 44345.125 | 34.01 |
| 44345.135416666664 | 34.04 |
| 44345.145833333336 | 33.88 |
| 44345.15625 | 33.91 |
| 44345.166666666664 | 33.79 |
| 44345.177083333336 | 33.94 |
| 44345.1875 | 33.79 |
| 44345.197916666664 | 33.85 |
| 44345.208333333336 | 33.89 |
| 44345.21875 | 33.91 |
| 44345.229166666664 | 33.92 |
| 44345.239583333336 | 33.88 |
| 44345.25 | 33.84 |
| 44345.260416666664 | 33.81 |
| 44345.270833333336 | 33.78 |
| 44345.28125 | 33.89 |
| 44345.291666666664 | 33.79 |
| 44345.302083333336 | 33.79 |
| 44345.3125 | 33.77 |
| 44345.322916666664 | 33.76 |
| 44345.333333333336 | 33.47 |
| 44345.34375 | 33.26 |
| 44345.354166666664 | 33.26 |
| 44345.364583333336 | 33.1 |
| 44345.375 | 33.02 |
| 44345.385416666664 | 33.04 |
| 44345.395833333336 | 32.9 |
| 44345.40625 | 32.74 |
| 44345.416666666664 | 32.62 |
| 44345.427083333336 | 32.62 |
| 44345.4375 | 32.59 |
| 44345.447916666664 | 32.78 |
| 44345.458333333336 | 32.81 |
| 44345.46875 | 32.9 |
| 44345.479166666664 | 32.99 |
| 44345.489583333336 | 33.1 |
| 44345.5 | 33.16 |
| 44345.510416666664 | 33.16 |
| 44345.520833333336 | 33.26 |
| 44345.53125 | 33.29 |
| 44345.541666666664 | 33.31 |
| 44345.552083333336 | 33.32 |
| 44345.5625 | 33.31 |
| 44345.572916666664 | 33.35 |
| 44345.583333333336 | 33.37 |
| 44345.59375 | 33.33 |
| 44345.604166666664 | 33.32 |
| 44345.614583333336 | 33.3 |
| 44345.625 | 33.27 |
| 44345.635416666664 | 33.24 |
| 44345.645833333336 | 33.22 |
| 44345.65625 | 33.18 |
| 44345.666666666664 | 33.18 |
| 44345.677083333336 | 33.19 |
| 44345.6875 | 33.18 |
| 44345.697916666664 | 33.18 |
| 44345.708333333336 | 33.17 |
| 44345.71875 | 33.16 |
| 44345.729166666664 | 33.17 |
| 44345.739583333336 | 33.12 |
| 44345.75 | 33.08 |
| 44345.760416666664 | 33.08 |
| 44345.770833333336 | 33.04 |
| 44345.78125 | 33.06 |
| 44345.791666666664 | 33.03 |
| 44345.802083333336 | 33.01 |
| 44345.8125 | 33.02 |
| 44345.822916666664 | 32.95 |
| 44345.833333333336 | 32.97 |
| 44345.84375 | 32.91 |
| 44345.854166666664 | 32.87 |
| 44345.864583333336 | 32.86 |
| 44345.875 | 32.86 |
| 44345.885416666664 | 32.85 |
| 44345.895833333336 | 32.84 |
| 44345.90625 | 32.85 |
| 44345.916666666664 | 32.8 |
| 44345.927083333336 | 32.81 |
| 44345.9375 | 32.74 |
| 44345.947916666664 | 32.74 |
| 44345.958333333336 | 32.74 |
| 44345.96875 | 32.77 |
| 44345.979166666664 | 32.76 |
| 44345.989583333336 | 32.78 |
| 44346.0 | 32.83 |
| 44346.010416666664 | 30.83 |
| 44346.020833333336 | 32.9 |
| 44346.03125 | 32.14 |
| 44346.041666666664 | 32.88 |
| 44346.052083333336 | 32.85 |
| 44346.0625 | 32.85 |
| 44346.072916666664 | 32.74 |
| 44346.083333333336 | 32.82 |
| 44346.09375 | 32.83 |
| 44346.104166666664 | 32.83 |
| 44346.114583333336 | 32.85 |
| 44346.125 | 32.85 |
| 44346.135416666664 | 32.85 |
| 44346.145833333336 | 32.84 |
| 44346.15625 | 32.84 |
| 44346.166666666664 | 32.84 |
| 44346.177083333336 | 32.84 |
| 44346.1875 | 32.84 |
| 44346.197916666664 | 32.85 |
| 44346.208333333336 | 32.86 |
| 44346.21875 | 32.86 |
| 44346.229166666664 | 32.86 |
| 44346.239583333336 | 32.86 |
| 44346.25 | 32.86 |
| 44346.260416666664 | 32.87 |
| 44346.270833333336 | 32.86 |
| 44346.28125 | 32.87 |
| 44346.291666666664 | 32.86 |
| 44346.302083333336 | 32.86 |
| 44346.3125 | 32.88 |
| 44346.322916666664 | 32.87 |
| 44346.333333333336 | 32.89 |
| 44346.34375 | 32.87 |
| 44346.354166666664 | 32.85 |
| 44346.364583333336 | 32.86 |
| 44346.375 | 32.85 |
| 44346.385416666664 | 32.85 |
| 44346.395833333336 | 32.84 |
| 44346.40625 | 32.82 |
| 44346.416666666664 | 32.8 |
| 44346.427083333336 | 32.82 |
| 44346.4375 | 32.78 |
| 44346.447916666664 | 32.78 |
| 44346.458333333336 | 32.79 |
| 44346.46875 | 32.76 |
| 44346.479166666664 | 32.63 |
| 44346.489583333336 | 32.53 |
| 44346.5 | 32.51 |
| 44346.510416666664 | 32.5 |
| 44346.520833333336 | 32.53 |
| 44346.53125 | 32.5 |
| 44346.541666666664 | 32.52 |
| 44346.552083333336 | 32.53 |
| 44346.5625 | 32.49 |
| 44346.572916666664 | 32.43 |
| 44346.583333333336 | 32.43 |
| 44346.59375 | 32.45 |
| 44346.604166666664 | 32.46 |
| 44346.614583333336 | 32.46 |
| 44346.625 | 32.46 |
| 44346.635416666664 | 32.47 |
| 44346.645833333336 | 32.49 |
| 44346.65625 | 32.52 |
| 44346.666666666664 | 32.54 |
| 44346.677083333336 | 32.55 |
| 44346.6875 | 32.55 |
| 44346.697916666664 | 32.54 |
| 44346.708333333336 | 32.52 |
| 44346.71875 | 32.52 |
| 44346.729166666664 | 32.48 |
| 44346.739583333336 | 32.43 |
| 44346.75 | 32.41 |
| 44346.760416666664 | 32.41 |
| 44346.770833333336 | 32.41 |
| 44346.78125 | 32.42 |
| 44346.791666666664 | 32.41 |
| 44346.802083333336 | 32.39 |
| 44346.8125 | 32.34 |
| 44346.822916666664 | 32.28 |
| 44346.833333333336 | 32.21 |
| 44346.84375 | 32.15 |
| 44346.854166666664 | 32.15 |
| 44346.864583333336 | 32.14 |
| 44346.875 | 32.19 |
| 44346.885416666664 | 32.15 |
| 44346.895833333336 | 32.14 |
| 44346.90625 | 32.11 |
| 44346.916666666664 | 32.08 |
| 44346.927083333336 | 32.01 |
| 44346.9375 | 31.96 |
| 44346.947916666664 | 31.84 |
| 44346.958333333336 | 31.79 |
| 44346.96875 | 31.74 |
| 44346.979166666664 | 31.85 |
| 44346.989583333336 | 31.86 |
| 44347.0 | 31.85 |
| 44347.010416666664 | 31.9 |
| 44347.020833333336 | 31.97 |
| 44347.03125 | 32.07 |
| 44347.041666666664 | 32.15 |
| 44347.052083333336 | 32.22 |
| 44347.0625 | 32.22 |
| 44347.072916666664 | 32.23 |
| 44347.083333333336 | 32.23 |
| 44347.09375 | 32.25 |
| 44347.104166666664 | 32.27 |
| 44347.114583333336 | 32.3 |
| 44347.125 | 32.33 |
| 44347.135416666664 | 32.36 |
| 44347.145833333336 | 32.39 |
| 44347.15625 | 32.41 |
| 44347.166666666664 | 32.42 |
| 44347.177083333336 | 32.42 |
| 44347.1875 | 32.43 |
| 44347.197916666664 | 32.43 |
| 44347.208333333336 | 32.43 |
| 44347.21875 | 32.44 |
| 44347.229166666664 | 32.44 |
| 44347.239583333336 | 32.42 |
| 44347.25 | 32.39 |
| 44347.260416666664 | 32.4 |
| 44347.270833333336 | 32.39 |
| 44347.28125 | 32.38 |
| 44347.291666666664 | 32.37 |
| 44347.302083333336 | 32.36 |
| 44347.3125 | 32.35 |
| 44347.322916666664 | 32.29 |
| 44347.333333333336 | 32.34 |
| 44347.34375 | 32.32 |
| 44347.354166666664 | 32.31 |
| 44347.364583333336 | 32.27 |
| 44347.375 | 32.3 |
| 44347.385416666664 | 32.23 |
| 44347.395833333336 | 32.24 |
| 44347.40625 | 32.22 |
| 44347.416666666664 | 32.18 |
| 44347.427083333336 | 32.14 |
| 44347.4375 | 32.14 |
| 44347.447916666664 | 32.03 |
| 44347.458333333336 | 31.92 |
| 44347.46875 | 31.84 |
| 44347.479166666664 | 31.63 |
| 44347.489583333336 | 31.57 |
| 44347.5 | 31.53 |
| 44347.510416666664 | 31.51 |
| 44347.520833333336 | 31.6 |
| 44347.53125 | 31.64 |
| 44347.541666666664 | 31.64 |
| 44347.552083333336 | 31.68 |
| 44347.5625 | 31.78 |
| 44347.572916666664 | 31.85 |
| 44347.583333333336 | 32.02 |
| 44347.59375 | 32.11 |
| 44347.604166666664 | 32.19 |
| 44347.614583333336 | 32.2 |
| 44347.625 | 32.21 |
| 44347.635416666664 | 32.22 |
| 44347.645833333336 | 32.23 |
| 44347.65625 | 32.26 |
| 44347.666666666664 | 32.28 |
| 44347.677083333336 | 32.31 |
| 44347.6875 | 32.33 |
| 44347.697916666664 | 32.34 |
| 44347.708333333336 | 32.38 |
| 44347.71875 | 32.39 |
| 44347.729166666664 | 32.39 |
| 44347.739583333336 | 32.38 |
| 44347.75 | 32.35 |
| 44347.760416666664 | 32.29 |
| 44347.770833333336 | 32.38 |
| 44347.78125 | 32.39 |
| 44347.791666666664 | 32.4 |
| 44347.802083333336 | 32.4 |
| 44347.8125 | 32.37 |
| 44347.822916666664 | 32.34 |
| 44347.833333333336 | 32.32 |
| 44347.84375 | 32.32 |
| 44347.854166666664 | 32.37 |
| 44347.864583333336 | 32.32 |
| 44347.875 | 32.35 |
| 44347.885416666664 | 32.34 |
| 44347.895833333336 | 32.2 |
| 44347.90625 | 32.13 |
| 44347.916666666664 | 32.07 |
| 44347.927083333336 | 32.05 |
| 44347.9375 | 31.96 |
| 44347.947916666664 | 31.92 |
| 44347.958333333336 | 31.68 |
| 44347.96875 | 31.6 |
| 44347.979166666664 | 31.43 |
| 44347.989583333336 | 31.39 |
| 44348.0 | 31.41 |
| 44348.010416666664 | 31.57 |
| 44348.020833333336 | 31.58 |
| 44348.03125 | 31.58 |
| 44348.041666666664 | 31.63 |
| 44348.052083333336 | 31.73 |
| 44348.0625 | 31.85 |
| 44348.072916666664 | 32 |
| 44348.083333333336 | 32.1 |
| 44348.09375 | 32.14 |
| 44348.104166666664 | 32.17 |
| 44348.114583333336 | 32.21 |
| 44348.125 | 32.24 |
| 44348.135416666664 | 32.27 |
| 44348.145833333336 | 32.3 |
| 44348.15625 | 32.32 |